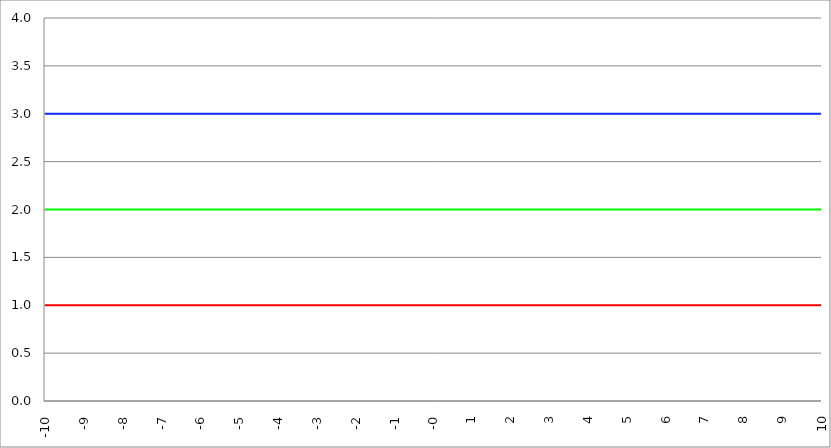
| Category | Series 1 | Series 0 | Series 2 |
|---|---|---|---|
| -10.0 | 1 | 2 | 3 |
| -9.99 | 1 | 2 | 3 |
| -9.98 | 1 | 2 | 3 |
| -9.97 | 1 | 2 | 3 |
| -9.96 | 1 | 2 | 3 |
| -9.95 | 1 | 2 | 3 |
| -9.940000000000001 | 1 | 2 | 3 |
| -9.930000000000001 | 1 | 2 | 3 |
| -9.920000000000002 | 1 | 2 | 3 |
| -9.91 | 1 | 2 | 3 |
| -9.900000000000002 | 1 | 2 | 3 |
| -9.890000000000002 | 1 | 2 | 3 |
| -9.880000000000003 | 1 | 2 | 3 |
| -9.870000000000003 | 1 | 2 | 3 |
| -9.860000000000001 | 1 | 2 | 3 |
| -9.850000000000003 | 1 | 2 | 3 |
| -9.840000000000003 | 1 | 2 | 3 |
| -9.830000000000004 | 1 | 2 | 3 |
| -9.820000000000004 | 1 | 2 | 3 |
| -9.810000000000004 | 1 | 2 | 3 |
| -9.800000000000004 | 1 | 2 | 3 |
| -9.790000000000004 | 1 | 2 | 3 |
| -9.780000000000005 | 1 | 2 | 3 |
| -9.770000000000005 | 1 | 2 | 3 |
| -9.760000000000005 | 1 | 2 | 3 |
| -9.750000000000005 | 1 | 2 | 3 |
| -9.740000000000006 | 1 | 2 | 3 |
| -9.730000000000006 | 1 | 2 | 3 |
| -9.720000000000006 | 1 | 2 | 3 |
| -9.710000000000006 | 1 | 2 | 3 |
| -9.700000000000006 | 1 | 2 | 3 |
| -9.690000000000007 | 1 | 2 | 3 |
| -9.680000000000007 | 1 | 2 | 3 |
| -9.670000000000007 | 1 | 2 | 3 |
| -9.660000000000007 | 1 | 2 | 3 |
| -9.650000000000007 | 1 | 2 | 3 |
| -9.640000000000008 | 1 | 2 | 3 |
| -9.630000000000008 | 1 | 2 | 3 |
| -9.620000000000008 | 1 | 2 | 3 |
| -9.610000000000008 | 1 | 2 | 3 |
| -9.600000000000009 | 1 | 2 | 3 |
| -9.590000000000009 | 1 | 2 | 3 |
| -9.580000000000007 | 1 | 2 | 3 |
| -9.57000000000001 | 1 | 2 | 3 |
| -9.56000000000001 | 1 | 2 | 3 |
| -9.55000000000001 | 1 | 2 | 3 |
| -9.54000000000001 | 1 | 2 | 3 |
| -9.53000000000001 | 1 | 2 | 3 |
| -9.52000000000001 | 1 | 2 | 3 |
| -9.51000000000001 | 1 | 2 | 3 |
| -9.50000000000001 | 1 | 2 | 3 |
| -9.49000000000001 | 1 | 2 | 3 |
| -9.48000000000001 | 1 | 2 | 3 |
| -9.47000000000001 | 1 | 2 | 3 |
| -9.46000000000001 | 1 | 2 | 3 |
| -9.45000000000001 | 1 | 2 | 3 |
| -9.44000000000001 | 1 | 2 | 3 |
| -9.430000000000012 | 1 | 2 | 3 |
| -9.420000000000012 | 1 | 2 | 3 |
| -9.410000000000013 | 1 | 2 | 3 |
| -9.400000000000013 | 1 | 2 | 3 |
| -9.390000000000011 | 1 | 2 | 3 |
| -9.380000000000013 | 1 | 2 | 3 |
| -9.370000000000013 | 1 | 2 | 3 |
| -9.360000000000014 | 1 | 2 | 3 |
| -9.350000000000014 | 1 | 2 | 3 |
| -9.340000000000014 | 1 | 2 | 3 |
| -9.330000000000014 | 1 | 2 | 3 |
| -9.320000000000014 | 1 | 2 | 3 |
| -9.310000000000015 | 1 | 2 | 3 |
| -9.300000000000013 | 1 | 2 | 3 |
| -9.290000000000015 | 1 | 2 | 3 |
| -9.280000000000015 | 1 | 2 | 3 |
| -9.270000000000016 | 1 | 2 | 3 |
| -9.260000000000016 | 1 | 2 | 3 |
| -9.250000000000014 | 1 | 2 | 3 |
| -9.240000000000016 | 1 | 2 | 3 |
| -9.230000000000016 | 1 | 2 | 3 |
| -9.220000000000017 | 1 | 2 | 3 |
| -9.210000000000017 | 1 | 2 | 3 |
| -9.200000000000017 | 1 | 2 | 3 |
| -9.190000000000017 | 1 | 2 | 3 |
| -9.180000000000017 | 1 | 2 | 3 |
| -9.170000000000018 | 1 | 2 | 3 |
| -9.160000000000016 | 1 | 2 | 3 |
| -9.150000000000018 | 1 | 2 | 3 |
| -9.140000000000018 | 1 | 2 | 3 |
| -9.130000000000019 | 1 | 2 | 3 |
| -9.120000000000019 | 1 | 2 | 3 |
| -9.110000000000017 | 1 | 2 | 3 |
| -9.10000000000002 | 1 | 2 | 3 |
| -9.09000000000002 | 1 | 2 | 3 |
| -9.08000000000002 | 1 | 2 | 3 |
| -9.07000000000002 | 1 | 2 | 3 |
| -9.06000000000002 | 1 | 2 | 3 |
| -9.05000000000002 | 1 | 2 | 3 |
| -9.04000000000002 | 1 | 2 | 3 |
| -9.03000000000002 | 1 | 2 | 3 |
| -9.020000000000021 | 1 | 2 | 3 |
| -9.010000000000021 | 1 | 2 | 3 |
| -9.000000000000021 | 1 | 2 | 3 |
| -8.990000000000022 | 1 | 2 | 3 |
| -8.980000000000022 | 1 | 2 | 3 |
| -8.97000000000002 | 1 | 2 | 3 |
| -8.960000000000022 | 1 | 2 | 3 |
| -8.950000000000022 | 1 | 2 | 3 |
| -8.940000000000023 | 1 | 2 | 3 |
| -8.930000000000023 | 1 | 2 | 3 |
| -8.920000000000023 | 1 | 2 | 3 |
| -8.910000000000023 | 1 | 2 | 3 |
| -8.900000000000023 | 1 | 2 | 3 |
| -8.890000000000024 | 1 | 2 | 3 |
| -8.880000000000024 | 1 | 2 | 3 |
| -8.870000000000024 | 1 | 2 | 3 |
| -8.860000000000024 | 1 | 2 | 3 |
| -8.850000000000025 | 1 | 2 | 3 |
| -8.840000000000025 | 1 | 2 | 3 |
| -8.830000000000025 | 1 | 2 | 3 |
| -8.820000000000025 | 1 | 2 | 3 |
| -8.810000000000025 | 1 | 2 | 3 |
| -8.800000000000026 | 1 | 2 | 3 |
| -8.790000000000026 | 1 | 2 | 3 |
| -8.780000000000026 | 1 | 2 | 3 |
| -8.770000000000026 | 1 | 2 | 3 |
| -8.760000000000026 | 1 | 2 | 3 |
| -8.750000000000027 | 1 | 2 | 3 |
| -8.740000000000027 | 1 | 2 | 3 |
| -8.730000000000027 | 1 | 2 | 3 |
| -8.720000000000027 | 1 | 2 | 3 |
| -8.710000000000027 | 1 | 2 | 3 |
| -8.700000000000028 | 1 | 2 | 3 |
| -8.690000000000028 | 1 | 2 | 3 |
| -8.680000000000028 | 1 | 2 | 3 |
| -8.670000000000028 | 1 | 2 | 3 |
| -8.660000000000029 | 1 | 2 | 3 |
| -8.650000000000029 | 1 | 2 | 3 |
| -8.640000000000029 | 1 | 2 | 3 |
| -8.63000000000003 | 1 | 2 | 3 |
| -8.62000000000003 | 1 | 2 | 3 |
| -8.61000000000003 | 1 | 2 | 3 |
| -8.60000000000003 | 1 | 2 | 3 |
| -8.59000000000003 | 1 | 2 | 3 |
| -8.58000000000003 | 1 | 2 | 3 |
| -8.57000000000003 | 1 | 2 | 3 |
| -8.56000000000003 | 1 | 2 | 3 |
| -8.55000000000003 | 1 | 2 | 3 |
| -8.540000000000031 | 1 | 2 | 3 |
| -8.530000000000031 | 1 | 2 | 3 |
| -8.520000000000032 | 1 | 2 | 3 |
| -8.510000000000032 | 1 | 2 | 3 |
| -8.50000000000003 | 1 | 2 | 3 |
| -8.490000000000032 | 1 | 2 | 3 |
| -8.480000000000032 | 1 | 2 | 3 |
| -8.470000000000033 | 1 | 2 | 3 |
| -8.460000000000033 | 1 | 2 | 3 |
| -8.450000000000033 | 1 | 2 | 3 |
| -8.440000000000033 | 1 | 2 | 3 |
| -8.430000000000033 | 1 | 2 | 3 |
| -8.420000000000034 | 1 | 2 | 3 |
| -8.410000000000032 | 1 | 2 | 3 |
| -8.400000000000034 | 1 | 2 | 3 |
| -8.390000000000034 | 1 | 2 | 3 |
| -8.380000000000035 | 1 | 2 | 3 |
| -8.370000000000035 | 1 | 2 | 3 |
| -8.360000000000033 | 1 | 2 | 3 |
| -8.350000000000035 | 1 | 2 | 3 |
| -8.340000000000035 | 1 | 2 | 3 |
| -8.330000000000036 | 1 | 2 | 3 |
| -8.320000000000036 | 1 | 2 | 3 |
| -8.310000000000034 | 1 | 2 | 3 |
| -8.300000000000036 | 1 | 2 | 3 |
| -8.290000000000036 | 1 | 2 | 3 |
| -8.280000000000037 | 1 | 2 | 3 |
| -8.270000000000037 | 1 | 2 | 3 |
| -8.260000000000037 | 1 | 2 | 3 |
| -8.250000000000037 | 1 | 2 | 3 |
| -8.240000000000038 | 1 | 2 | 3 |
| -8.230000000000038 | 1 | 2 | 3 |
| -8.220000000000038 | 1 | 2 | 3 |
| -8.210000000000038 | 1 | 2 | 3 |
| -8.200000000000038 | 1 | 2 | 3 |
| -8.190000000000039 | 1 | 2 | 3 |
| -8.180000000000039 | 1 | 2 | 3 |
| -8.170000000000037 | 1 | 2 | 3 |
| -8.16000000000004 | 1 | 2 | 3 |
| -8.15000000000004 | 1 | 2 | 3 |
| -8.14000000000004 | 1 | 2 | 3 |
| -8.13000000000004 | 1 | 2 | 3 |
| -8.12000000000004 | 1 | 2 | 3 |
| -8.11000000000004 | 1 | 2 | 3 |
| -8.10000000000004 | 1 | 2 | 3 |
| -8.09000000000004 | 1 | 2 | 3 |
| -8.08000000000004 | 1 | 2 | 3 |
| -8.07000000000004 | 1 | 2 | 3 |
| -8.06000000000004 | 1 | 2 | 3 |
| -8.05000000000004 | 1 | 2 | 3 |
| -8.040000000000042 | 1 | 2 | 3 |
| -8.03000000000004 | 1 | 2 | 3 |
| -8.020000000000042 | 1 | 2 | 3 |
| -8.010000000000042 | 1 | 2 | 3 |
| -8.000000000000043 | 1 | 2 | 3 |
| -7.990000000000043 | 1 | 2 | 3 |
| -7.980000000000043 | 1 | 2 | 3 |
| -7.970000000000043 | 1 | 2 | 3 |
| -7.960000000000043 | 1 | 2 | 3 |
| -7.950000000000044 | 1 | 2 | 3 |
| -7.940000000000044 | 1 | 2 | 3 |
| -7.930000000000044 | 1 | 2 | 3 |
| -7.920000000000044 | 1 | 2 | 3 |
| -7.910000000000044 | 1 | 2 | 3 |
| -7.900000000000044 | 1 | 2 | 3 |
| -7.890000000000045 | 1 | 2 | 3 |
| -7.880000000000045 | 1 | 2 | 3 |
| -7.870000000000045 | 1 | 2 | 3 |
| -7.860000000000046 | 1 | 2 | 3 |
| -7.850000000000046 | 1 | 2 | 3 |
| -7.840000000000046 | 1 | 2 | 3 |
| -7.830000000000046 | 1 | 2 | 3 |
| -7.820000000000046 | 1 | 2 | 3 |
| -7.810000000000047 | 1 | 2 | 3 |
| -7.800000000000047 | 1 | 2 | 3 |
| -7.790000000000047 | 1 | 2 | 3 |
| -7.780000000000047 | 1 | 2 | 3 |
| -7.770000000000047 | 1 | 2 | 3 |
| -7.760000000000048 | 1 | 2 | 3 |
| -7.750000000000048 | 1 | 2 | 3 |
| -7.740000000000048 | 1 | 2 | 3 |
| -7.730000000000048 | 1 | 2 | 3 |
| -7.720000000000049 | 1 | 2 | 3 |
| -7.710000000000049 | 1 | 2 | 3 |
| -7.700000000000049 | 1 | 2 | 3 |
| -7.690000000000049 | 1 | 2 | 3 |
| -7.680000000000049 | 1 | 2 | 3 |
| -7.67000000000005 | 1 | 2 | 3 |
| -7.66000000000005 | 1 | 2 | 3 |
| -7.65000000000005 | 1 | 2 | 3 |
| -7.64000000000005 | 1 | 2 | 3 |
| -7.63000000000005 | 1 | 2 | 3 |
| -7.620000000000051 | 1 | 2 | 3 |
| -7.610000000000051 | 1 | 2 | 3 |
| -7.600000000000051 | 1 | 2 | 3 |
| -7.590000000000051 | 1 | 2 | 3 |
| -7.580000000000052 | 1 | 2 | 3 |
| -7.570000000000052 | 1 | 2 | 3 |
| -7.560000000000052 | 1 | 2 | 3 |
| -7.550000000000052 | 1 | 2 | 3 |
| -7.540000000000052 | 1 | 2 | 3 |
| -7.530000000000053 | 1 | 2 | 3 |
| -7.520000000000053 | 1 | 2 | 3 |
| -7.510000000000053 | 1 | 2 | 3 |
| -7.500000000000053 | 1 | 2 | 3 |
| -7.490000000000053 | 1 | 2 | 3 |
| -7.480000000000054 | 1 | 2 | 3 |
| -7.470000000000054 | 1 | 2 | 3 |
| -7.460000000000054 | 1 | 2 | 3 |
| -7.450000000000054 | 1 | 2 | 3 |
| -7.440000000000054 | 1 | 2 | 3 |
| -7.430000000000054 | 1 | 2 | 3 |
| -7.420000000000055 | 1 | 2 | 3 |
| -7.410000000000055 | 1 | 2 | 3 |
| -7.400000000000055 | 1 | 2 | 3 |
| -7.390000000000056 | 1 | 2 | 3 |
| -7.380000000000056 | 1 | 2 | 3 |
| -7.370000000000056 | 1 | 2 | 3 |
| -7.360000000000056 | 1 | 2 | 3 |
| -7.350000000000056 | 1 | 2 | 3 |
| -7.340000000000057 | 1 | 2 | 3 |
| -7.330000000000057 | 1 | 2 | 3 |
| -7.320000000000057 | 1 | 2 | 3 |
| -7.310000000000057 | 1 | 2 | 3 |
| -7.300000000000058 | 1 | 2 | 3 |
| -7.290000000000058 | 1 | 2 | 3 |
| -7.280000000000058 | 1 | 2 | 3 |
| -7.270000000000058 | 1 | 2 | 3 |
| -7.260000000000058 | 1 | 2 | 3 |
| -7.250000000000059 | 1 | 2 | 3 |
| -7.240000000000059 | 1 | 2 | 3 |
| -7.23000000000006 | 1 | 2 | 3 |
| -7.220000000000059 | 1 | 2 | 3 |
| -7.210000000000059 | 1 | 2 | 3 |
| -7.20000000000006 | 1 | 2 | 3 |
| -7.19000000000006 | 1 | 2 | 3 |
| -7.18000000000006 | 1 | 2 | 3 |
| -7.17000000000006 | 1 | 2 | 3 |
| -7.160000000000061 | 1 | 2 | 3 |
| -7.150000000000061 | 1 | 2 | 3 |
| -7.140000000000061 | 1 | 2 | 3 |
| -7.130000000000061 | 1 | 2 | 3 |
| -7.120000000000061 | 1 | 2 | 3 |
| -7.110000000000062 | 1 | 2 | 3 |
| -7.100000000000062 | 1 | 2 | 3 |
| -7.090000000000062 | 1 | 2 | 3 |
| -7.080000000000062 | 1 | 2 | 3 |
| -7.070000000000062 | 1 | 2 | 3 |
| -7.060000000000063 | 1 | 2 | 3 |
| -7.050000000000063 | 1 | 2 | 3 |
| -7.040000000000063 | 1 | 2 | 3 |
| -7.030000000000063 | 1 | 2 | 3 |
| -7.020000000000064 | 1 | 2 | 3 |
| -7.010000000000064 | 1 | 2 | 3 |
| -7.000000000000064 | 1 | 2 | 3 |
| -6.990000000000064 | 1 | 2 | 3 |
| -6.980000000000064 | 1 | 2 | 3 |
| -6.970000000000064 | 1 | 2 | 3 |
| -6.960000000000064 | 1 | 2 | 3 |
| -6.950000000000064 | 1 | 2 | 3 |
| -6.940000000000065 | 1 | 2 | 3 |
| -6.930000000000065 | 1 | 2 | 3 |
| -6.920000000000065 | 1 | 2 | 3 |
| -6.910000000000065 | 1 | 2 | 3 |
| -6.900000000000066 | 1 | 2 | 3 |
| -6.890000000000066 | 1 | 2 | 3 |
| -6.880000000000066 | 1 | 2 | 3 |
| -6.870000000000066 | 1 | 2 | 3 |
| -6.860000000000067 | 1 | 2 | 3 |
| -6.850000000000067 | 1 | 2 | 3 |
| -6.840000000000067 | 1 | 2 | 3 |
| -6.830000000000067 | 1 | 2 | 3 |
| -6.820000000000068 | 1 | 2 | 3 |
| -6.810000000000068 | 1 | 2 | 3 |
| -6.800000000000068 | 1 | 2 | 3 |
| -6.790000000000068 | 1 | 2 | 3 |
| -6.780000000000068 | 1 | 2 | 3 |
| -6.770000000000068 | 1 | 2 | 3 |
| -6.760000000000069 | 1 | 2 | 3 |
| -6.75000000000007 | 1 | 2 | 3 |
| -6.74000000000007 | 1 | 2 | 3 |
| -6.73000000000007 | 1 | 2 | 3 |
| -6.72000000000007 | 1 | 2 | 3 |
| -6.71000000000007 | 1 | 2 | 3 |
| -6.70000000000007 | 1 | 2 | 3 |
| -6.69000000000007 | 1 | 2 | 3 |
| -6.680000000000071 | 1 | 2 | 3 |
| -6.670000000000071 | 1 | 2 | 3 |
| -6.660000000000071 | 1 | 2 | 3 |
| -6.650000000000071 | 1 | 2 | 3 |
| -6.640000000000072 | 1 | 2 | 3 |
| -6.630000000000072 | 1 | 2 | 3 |
| -6.620000000000072 | 1 | 2 | 3 |
| -6.610000000000072 | 1 | 2 | 3 |
| -6.600000000000072 | 1 | 2 | 3 |
| -6.590000000000073 | 1 | 2 | 3 |
| -6.580000000000073 | 1 | 2 | 3 |
| -6.570000000000073 | 1 | 2 | 3 |
| -6.560000000000073 | 1 | 2 | 3 |
| -6.550000000000074 | 1 | 2 | 3 |
| -6.540000000000074 | 1 | 2 | 3 |
| -6.530000000000074 | 1 | 2 | 3 |
| -6.520000000000074 | 1 | 2 | 3 |
| -6.510000000000074 | 1 | 2 | 3 |
| -6.500000000000074 | 1 | 2 | 3 |
| -6.490000000000074 | 1 | 2 | 3 |
| -6.480000000000074 | 1 | 2 | 3 |
| -6.470000000000075 | 1 | 2 | 3 |
| -6.460000000000075 | 1 | 2 | 3 |
| -6.450000000000075 | 1 | 2 | 3 |
| -6.440000000000075 | 1 | 2 | 3 |
| -6.430000000000076 | 1 | 2 | 3 |
| -6.420000000000076 | 1 | 2 | 3 |
| -6.410000000000076 | 1 | 2 | 3 |
| -6.400000000000076 | 1 | 2 | 3 |
| -6.390000000000077 | 1 | 2 | 3 |
| -6.380000000000077 | 1 | 2 | 3 |
| -6.370000000000077 | 1 | 2 | 3 |
| -6.360000000000078 | 1 | 2 | 3 |
| -6.350000000000078 | 1 | 2 | 3 |
| -6.340000000000078 | 1 | 2 | 3 |
| -6.330000000000078 | 1 | 2 | 3 |
| -6.320000000000078 | 1 | 2 | 3 |
| -6.310000000000079 | 1 | 2 | 3 |
| -6.300000000000079 | 1 | 2 | 3 |
| -6.29000000000008 | 1 | 2 | 3 |
| -6.28000000000008 | 1 | 2 | 3 |
| -6.27000000000008 | 1 | 2 | 3 |
| -6.26000000000008 | 1 | 2 | 3 |
| -6.25000000000008 | 1 | 2 | 3 |
| -6.24000000000008 | 1 | 2 | 3 |
| -6.23000000000008 | 1 | 2 | 3 |
| -6.220000000000081 | 1 | 2 | 3 |
| -6.210000000000081 | 1 | 2 | 3 |
| -6.200000000000081 | 1 | 2 | 3 |
| -6.190000000000081 | 1 | 2 | 3 |
| -6.180000000000081 | 1 | 2 | 3 |
| -6.170000000000082 | 1 | 2 | 3 |
| -6.160000000000082 | 1 | 2 | 3 |
| -6.150000000000082 | 1 | 2 | 3 |
| -6.140000000000082 | 1 | 2 | 3 |
| -6.130000000000082 | 1 | 2 | 3 |
| -6.120000000000083 | 1 | 2 | 3 |
| -6.110000000000083 | 1 | 2 | 3 |
| -6.100000000000083 | 1 | 2 | 3 |
| -6.090000000000083 | 1 | 2 | 3 |
| -6.080000000000084 | 1 | 2 | 3 |
| -6.070000000000084 | 1 | 2 | 3 |
| -6.060000000000084 | 1 | 2 | 3 |
| -6.050000000000084 | 1 | 2 | 3 |
| -6.040000000000084 | 1 | 2 | 3 |
| -6.030000000000084 | 1 | 2 | 3 |
| -6.020000000000085 | 1 | 2 | 3 |
| -6.010000000000085 | 1 | 2 | 3 |
| -6.000000000000085 | 1 | 2 | 3 |
| -5.990000000000085 | 1 | 2 | 3 |
| -5.980000000000085 | 1 | 2 | 3 |
| -5.970000000000085 | 1 | 2 | 3 |
| -5.960000000000086 | 1 | 2 | 3 |
| -5.950000000000086 | 1 | 2 | 3 |
| -5.940000000000086 | 1 | 2 | 3 |
| -5.930000000000086 | 1 | 2 | 3 |
| -5.920000000000087 | 1 | 2 | 3 |
| -5.910000000000087 | 1 | 2 | 3 |
| -5.900000000000087 | 1 | 2 | 3 |
| -5.890000000000088 | 1 | 2 | 3 |
| -5.880000000000088 | 1 | 2 | 3 |
| -5.870000000000088 | 1 | 2 | 3 |
| -5.860000000000088 | 1 | 2 | 3 |
| -5.850000000000088 | 1 | 2 | 3 |
| -5.840000000000089 | 1 | 2 | 3 |
| -5.830000000000089 | 1 | 2 | 3 |
| -5.820000000000089 | 1 | 2 | 3 |
| -5.810000000000089 | 1 | 2 | 3 |
| -5.800000000000089 | 1 | 2 | 3 |
| -5.79000000000009 | 1 | 2 | 3 |
| -5.78000000000009 | 1 | 2 | 3 |
| -5.77000000000009 | 1 | 2 | 3 |
| -5.76000000000009 | 1 | 2 | 3 |
| -5.750000000000091 | 1 | 2 | 3 |
| -5.740000000000091 | 1 | 2 | 3 |
| -5.730000000000091 | 1 | 2 | 3 |
| -5.720000000000091 | 1 | 2 | 3 |
| -5.710000000000091 | 1 | 2 | 3 |
| -5.700000000000092 | 1 | 2 | 3 |
| -5.690000000000092 | 1 | 2 | 3 |
| -5.680000000000092 | 1 | 2 | 3 |
| -5.670000000000092 | 1 | 2 | 3 |
| -5.660000000000092 | 1 | 2 | 3 |
| -5.650000000000093 | 1 | 2 | 3 |
| -5.640000000000093 | 1 | 2 | 3 |
| -5.630000000000093 | 1 | 2 | 3 |
| -5.620000000000093 | 1 | 2 | 3 |
| -5.610000000000093 | 1 | 2 | 3 |
| -5.600000000000094 | 1 | 2 | 3 |
| -5.590000000000094 | 1 | 2 | 3 |
| -5.580000000000094 | 1 | 2 | 3 |
| -5.570000000000094 | 1 | 2 | 3 |
| -5.560000000000095 | 1 | 2 | 3 |
| -5.550000000000095 | 1 | 2 | 3 |
| -5.540000000000095 | 1 | 2 | 3 |
| -5.530000000000095 | 1 | 2 | 3 |
| -5.520000000000095 | 1 | 2 | 3 |
| -5.510000000000096 | 1 | 2 | 3 |
| -5.500000000000096 | 1 | 2 | 3 |
| -5.490000000000096 | 1 | 2 | 3 |
| -5.480000000000096 | 1 | 2 | 3 |
| -5.470000000000096 | 1 | 2 | 3 |
| -5.460000000000097 | 1 | 2 | 3 |
| -5.450000000000097 | 1 | 2 | 3 |
| -5.440000000000097 | 1 | 2 | 3 |
| -5.430000000000097 | 1 | 2 | 3 |
| -5.420000000000098 | 1 | 2 | 3 |
| -5.410000000000098 | 1 | 2 | 3 |
| -5.400000000000098 | 1 | 2 | 3 |
| -5.390000000000098 | 1 | 2 | 3 |
| -5.380000000000098 | 1 | 2 | 3 |
| -5.370000000000099 | 1 | 2 | 3 |
| -5.360000000000099 | 1 | 2 | 3 |
| -5.350000000000099 | 1 | 2 | 3 |
| -5.340000000000099 | 1 | 2 | 3 |
| -5.330000000000099 | 1 | 2 | 3 |
| -5.3200000000001 | 1 | 2 | 3 |
| -5.3100000000001 | 1 | 2 | 3 |
| -5.3000000000001 | 1 | 2 | 3 |
| -5.2900000000001 | 1 | 2 | 3 |
| -5.2800000000001 | 1 | 2 | 3 |
| -5.2700000000001 | 1 | 2 | 3 |
| -5.260000000000101 | 1 | 2 | 3 |
| -5.250000000000101 | 1 | 2 | 3 |
| -5.240000000000101 | 1 | 2 | 3 |
| -5.230000000000101 | 1 | 2 | 3 |
| -5.220000000000102 | 1 | 2 | 3 |
| -5.210000000000102 | 1 | 2 | 3 |
| -5.200000000000102 | 1 | 2 | 3 |
| -5.190000000000103 | 1 | 2 | 3 |
| -5.180000000000103 | 1 | 2 | 3 |
| -5.170000000000103 | 1 | 2 | 3 |
| -5.160000000000103 | 1 | 2 | 3 |
| -5.150000000000103 | 1 | 2 | 3 |
| -5.140000000000104 | 1 | 2 | 3 |
| -5.130000000000104 | 1 | 2 | 3 |
| -5.120000000000104 | 1 | 2 | 3 |
| -5.110000000000104 | 1 | 2 | 3 |
| -5.100000000000104 | 1 | 2 | 3 |
| -5.090000000000104 | 1 | 2 | 3 |
| -5.080000000000104 | 1 | 2 | 3 |
| -5.070000000000105 | 1 | 2 | 3 |
| -5.060000000000105 | 1 | 2 | 3 |
| -5.050000000000105 | 1 | 2 | 3 |
| -5.040000000000105 | 1 | 2 | 3 |
| -5.030000000000105 | 1 | 2 | 3 |
| -5.020000000000106 | 1 | 2 | 3 |
| -5.010000000000106 | 1 | 2 | 3 |
| -5.000000000000106 | 1 | 2 | 3 |
| -4.990000000000106 | 1 | 2 | 3 |
| -4.980000000000106 | 1 | 2 | 3 |
| -4.970000000000107 | 1 | 2 | 3 |
| -4.960000000000107 | 1 | 2 | 3 |
| -4.950000000000107 | 1 | 2 | 3 |
| -4.940000000000107 | 1 | 2 | 3 |
| -4.930000000000108 | 1 | 2 | 3 |
| -4.920000000000108 | 1 | 2 | 3 |
| -4.910000000000108 | 1 | 2 | 3 |
| -4.900000000000108 | 1 | 2 | 3 |
| -4.890000000000109 | 1 | 2 | 3 |
| -4.88000000000011 | 1 | 2 | 3 |
| -4.87000000000011 | 1 | 2 | 3 |
| -4.86000000000011 | 1 | 2 | 3 |
| -4.85000000000011 | 1 | 2 | 3 |
| -4.84000000000011 | 1 | 2 | 3 |
| -4.83000000000011 | 1 | 2 | 3 |
| -4.82000000000011 | 1 | 2 | 3 |
| -4.810000000000111 | 1 | 2 | 3 |
| -4.800000000000111 | 1 | 2 | 3 |
| -4.790000000000111 | 1 | 2 | 3 |
| -4.780000000000111 | 1 | 2 | 3 |
| -4.770000000000111 | 1 | 2 | 3 |
| -4.760000000000112 | 1 | 2 | 3 |
| -4.750000000000112 | 1 | 2 | 3 |
| -4.740000000000112 | 1 | 2 | 3 |
| -4.730000000000112 | 1 | 2 | 3 |
| -4.720000000000112 | 1 | 2 | 3 |
| -4.710000000000113 | 1 | 2 | 3 |
| -4.700000000000113 | 1 | 2 | 3 |
| -4.690000000000113 | 1 | 2 | 3 |
| -4.680000000000113 | 1 | 2 | 3 |
| -4.670000000000114 | 1 | 2 | 3 |
| -4.660000000000114 | 1 | 2 | 3 |
| -4.650000000000114 | 1 | 2 | 3 |
| -4.640000000000114 | 1 | 2 | 3 |
| -4.630000000000114 | 1 | 2 | 3 |
| -4.620000000000115 | 1 | 2 | 3 |
| -4.610000000000115 | 1 | 2 | 3 |
| -4.600000000000115 | 1 | 2 | 3 |
| -4.590000000000115 | 1 | 2 | 3 |
| -4.580000000000115 | 1 | 2 | 3 |
| -4.570000000000115 | 1 | 2 | 3 |
| -4.560000000000116 | 1 | 2 | 3 |
| -4.550000000000116 | 1 | 2 | 3 |
| -4.540000000000116 | 1 | 2 | 3 |
| -4.530000000000116 | 1 | 2 | 3 |
| -4.520000000000117 | 1 | 2 | 3 |
| -4.510000000000117 | 1 | 2 | 3 |
| -4.500000000000117 | 1 | 2 | 3 |
| -4.490000000000117 | 1 | 2 | 3 |
| -4.480000000000117 | 1 | 2 | 3 |
| -4.470000000000117 | 1 | 2 | 3 |
| -4.460000000000118 | 1 | 2 | 3 |
| -4.450000000000118 | 1 | 2 | 3 |
| -4.440000000000118 | 1 | 2 | 3 |
| -4.430000000000118 | 1 | 2 | 3 |
| -4.420000000000119 | 1 | 2 | 3 |
| -4.41000000000012 | 1 | 2 | 3 |
| -4.40000000000012 | 1 | 2 | 3 |
| -4.39000000000012 | 1 | 2 | 3 |
| -4.38000000000012 | 1 | 2 | 3 |
| -4.37000000000012 | 1 | 2 | 3 |
| -4.36000000000012 | 1 | 2 | 3 |
| -4.35000000000012 | 1 | 2 | 3 |
| -4.34000000000012 | 1 | 2 | 3 |
| -4.33000000000012 | 1 | 2 | 3 |
| -4.320000000000121 | 1 | 2 | 3 |
| -4.310000000000121 | 1 | 2 | 3 |
| -4.300000000000121 | 1 | 2 | 3 |
| -4.290000000000121 | 1 | 2 | 3 |
| -4.280000000000121 | 1 | 2 | 3 |
| -4.270000000000122 | 1 | 2 | 3 |
| -4.260000000000122 | 1 | 2 | 3 |
| -4.250000000000122 | 1 | 2 | 3 |
| -4.240000000000122 | 1 | 2 | 3 |
| -4.230000000000122 | 1 | 2 | 3 |
| -4.220000000000123 | 1 | 2 | 3 |
| -4.210000000000123 | 1 | 2 | 3 |
| -4.200000000000123 | 1 | 2 | 3 |
| -4.190000000000124 | 1 | 2 | 3 |
| -4.180000000000124 | 1 | 2 | 3 |
| -4.170000000000124 | 1 | 2 | 3 |
| -4.160000000000124 | 1 | 2 | 3 |
| -4.150000000000124 | 1 | 2 | 3 |
| -4.140000000000124 | 1 | 2 | 3 |
| -4.130000000000125 | 1 | 2 | 3 |
| -4.120000000000125 | 1 | 2 | 3 |
| -4.110000000000125 | 1 | 2 | 3 |
| -4.100000000000125 | 1 | 2 | 3 |
| -4.090000000000125 | 1 | 2 | 3 |
| -4.080000000000126 | 1 | 2 | 3 |
| -4.070000000000126 | 1 | 2 | 3 |
| -4.060000000000126 | 1 | 2 | 3 |
| -4.050000000000126 | 1 | 2 | 3 |
| -4.040000000000127 | 1 | 2 | 3 |
| -4.030000000000127 | 1 | 2 | 3 |
| -4.020000000000127 | 1 | 2 | 3 |
| -4.010000000000127 | 1 | 2 | 3 |
| -4.000000000000127 | 1 | 2 | 3 |
| -3.990000000000128 | 1 | 2 | 3 |
| -3.980000000000128 | 1 | 2 | 3 |
| -3.970000000000129 | 1 | 2 | 3 |
| -3.960000000000129 | 1 | 2 | 3 |
| -3.950000000000129 | 1 | 2 | 3 |
| -3.940000000000129 | 1 | 2 | 3 |
| -3.930000000000129 | 1 | 2 | 3 |
| -3.92000000000013 | 1 | 2 | 3 |
| -3.91000000000013 | 1 | 2 | 3 |
| -3.90000000000013 | 1 | 2 | 3 |
| -3.89000000000013 | 1 | 2 | 3 |
| -3.88000000000013 | 1 | 2 | 3 |
| -3.870000000000131 | 1 | 2 | 3 |
| -3.860000000000131 | 1 | 2 | 3 |
| -3.850000000000131 | 1 | 2 | 3 |
| -3.840000000000131 | 1 | 2 | 3 |
| -3.830000000000131 | 1 | 2 | 3 |
| -3.820000000000132 | 1 | 2 | 3 |
| -3.810000000000132 | 1 | 2 | 3 |
| -3.800000000000132 | 1 | 2 | 3 |
| -3.790000000000132 | 1 | 2 | 3 |
| -3.780000000000132 | 1 | 2 | 3 |
| -3.770000000000133 | 1 | 2 | 3 |
| -3.760000000000133 | 1 | 2 | 3 |
| -3.750000000000133 | 1 | 2 | 3 |
| -3.740000000000133 | 1 | 2 | 3 |
| -3.730000000000134 | 1 | 2 | 3 |
| -3.720000000000134 | 1 | 2 | 3 |
| -3.710000000000134 | 1 | 2 | 3 |
| -3.700000000000134 | 1 | 2 | 3 |
| -3.690000000000134 | 1 | 2 | 3 |
| -3.680000000000135 | 1 | 2 | 3 |
| -3.670000000000135 | 1 | 2 | 3 |
| -3.660000000000135 | 1 | 2 | 3 |
| -3.650000000000135 | 1 | 2 | 3 |
| -3.640000000000135 | 1 | 2 | 3 |
| -3.630000000000136 | 1 | 2 | 3 |
| -3.620000000000136 | 1 | 2 | 3 |
| -3.610000000000136 | 1 | 2 | 3 |
| -3.600000000000136 | 1 | 2 | 3 |
| -3.590000000000137 | 1 | 2 | 3 |
| -3.580000000000137 | 1 | 2 | 3 |
| -3.570000000000137 | 1 | 2 | 3 |
| -3.560000000000137 | 1 | 2 | 3 |
| -3.550000000000137 | 1 | 2 | 3 |
| -3.540000000000138 | 1 | 2 | 3 |
| -3.530000000000138 | 1 | 2 | 3 |
| -3.520000000000138 | 1 | 2 | 3 |
| -3.510000000000138 | 1 | 2 | 3 |
| -3.500000000000139 | 1 | 2 | 3 |
| -3.490000000000139 | 1 | 2 | 3 |
| -3.480000000000139 | 1 | 2 | 3 |
| -3.470000000000139 | 1 | 2 | 3 |
| -3.460000000000139 | 1 | 2 | 3 |
| -3.45000000000014 | 1 | 2 | 3 |
| -3.44000000000014 | 1 | 2 | 3 |
| -3.43000000000014 | 1 | 2 | 3 |
| -3.42000000000014 | 1 | 2 | 3 |
| -3.41000000000014 | 1 | 2 | 3 |
| -3.400000000000141 | 1 | 2 | 3 |
| -3.390000000000141 | 1 | 2 | 3 |
| -3.380000000000141 | 1 | 2 | 3 |
| -3.370000000000141 | 1 | 2 | 3 |
| -3.360000000000141 | 1 | 2 | 3 |
| -3.350000000000142 | 1 | 2 | 3 |
| -3.340000000000142 | 1 | 2 | 3 |
| -3.330000000000142 | 1 | 2 | 3 |
| -3.320000000000142 | 1 | 2 | 3 |
| -3.310000000000143 | 1 | 2 | 3 |
| -3.300000000000143 | 1 | 2 | 3 |
| -3.290000000000143 | 1 | 2 | 3 |
| -3.280000000000143 | 1 | 2 | 3 |
| -3.270000000000143 | 1 | 2 | 3 |
| -3.260000000000144 | 1 | 2 | 3 |
| -3.250000000000144 | 1 | 2 | 3 |
| -3.240000000000144 | 1 | 2 | 3 |
| -3.230000000000144 | 1 | 2 | 3 |
| -3.220000000000145 | 1 | 2 | 3 |
| -3.210000000000145 | 1 | 2 | 3 |
| -3.200000000000145 | 1 | 2 | 3 |
| -3.190000000000145 | 1 | 2 | 3 |
| -3.180000000000145 | 1 | 2 | 3 |
| -3.170000000000146 | 1 | 2 | 3 |
| -3.160000000000146 | 1 | 2 | 3 |
| -3.150000000000146 | 1 | 2 | 3 |
| -3.140000000000146 | 1 | 2 | 3 |
| -3.130000000000146 | 1 | 2 | 3 |
| -3.120000000000147 | 1 | 2 | 3 |
| -3.110000000000147 | 1 | 2 | 3 |
| -3.100000000000147 | 1 | 2 | 3 |
| -3.090000000000147 | 1 | 2 | 3 |
| -3.080000000000147 | 1 | 2 | 3 |
| -3.070000000000148 | 1 | 2 | 3 |
| -3.060000000000148 | 1 | 2 | 3 |
| -3.050000000000148 | 1 | 2 | 3 |
| -3.040000000000148 | 1 | 2 | 3 |
| -3.030000000000149 | 1 | 2 | 3 |
| -3.020000000000149 | 1 | 2 | 3 |
| -3.010000000000149 | 1 | 2 | 3 |
| -3.000000000000149 | 1 | 2 | 3 |
| -2.990000000000149 | 1 | 2 | 3 |
| -2.98000000000015 | 1 | 2 | 3 |
| -2.97000000000015 | 1 | 2 | 3 |
| -2.96000000000015 | 1 | 2 | 3 |
| -2.95000000000015 | 1 | 2 | 3 |
| -2.94000000000015 | 1 | 2 | 3 |
| -2.930000000000151 | 1 | 2 | 3 |
| -2.920000000000151 | 1 | 2 | 3 |
| -2.910000000000151 | 1 | 2 | 3 |
| -2.900000000000151 | 1 | 2 | 3 |
| -2.890000000000151 | 1 | 2 | 3 |
| -2.880000000000152 | 1 | 2 | 3 |
| -2.870000000000152 | 1 | 2 | 3 |
| -2.860000000000152 | 1 | 2 | 3 |
| -2.850000000000152 | 1 | 2 | 3 |
| -2.840000000000153 | 1 | 2 | 3 |
| -2.830000000000153 | 1 | 2 | 3 |
| -2.820000000000153 | 1 | 2 | 3 |
| -2.810000000000153 | 1 | 2 | 3 |
| -2.800000000000153 | 1 | 2 | 3 |
| -2.790000000000154 | 1 | 2 | 3 |
| -2.780000000000154 | 1 | 2 | 3 |
| -2.770000000000154 | 1 | 2 | 3 |
| -2.760000000000154 | 1 | 2 | 3 |
| -2.750000000000154 | 1 | 2 | 3 |
| -2.740000000000155 | 1 | 2 | 3 |
| -2.730000000000155 | 1 | 2 | 3 |
| -2.720000000000155 | 1 | 2 | 3 |
| -2.710000000000155 | 1 | 2 | 3 |
| -2.700000000000156 | 1 | 2 | 3 |
| -2.690000000000156 | 1 | 2 | 3 |
| -2.680000000000156 | 1 | 2 | 3 |
| -2.670000000000156 | 1 | 2 | 3 |
| -2.660000000000156 | 1 | 2 | 3 |
| -2.650000000000157 | 1 | 2 | 3 |
| -2.640000000000157 | 1 | 2 | 3 |
| -2.630000000000157 | 1 | 2 | 3 |
| -2.620000000000157 | 1 | 2 | 3 |
| -2.610000000000157 | 1 | 2 | 3 |
| -2.600000000000158 | 1 | 2 | 3 |
| -2.590000000000158 | 1 | 2 | 3 |
| -2.580000000000158 | 1 | 2 | 3 |
| -2.570000000000158 | 1 | 2 | 3 |
| -2.560000000000159 | 1 | 2 | 3 |
| -2.550000000000159 | 1 | 2 | 3 |
| -2.54000000000016 | 1 | 2 | 3 |
| -2.530000000000159 | 1 | 2 | 3 |
| -2.520000000000159 | 1 | 2 | 3 |
| -2.51000000000016 | 1 | 2 | 3 |
| -2.50000000000016 | 1 | 2 | 3 |
| -2.49000000000016 | 1 | 2 | 3 |
| -2.48000000000016 | 1 | 2 | 3 |
| -2.47000000000016 | 1 | 2 | 3 |
| -2.460000000000161 | 1 | 2 | 3 |
| -2.450000000000161 | 1 | 2 | 3 |
| -2.440000000000161 | 1 | 2 | 3 |
| -2.430000000000161 | 1 | 2 | 3 |
| -2.420000000000162 | 1 | 2 | 3 |
| -2.410000000000162 | 1 | 2 | 3 |
| -2.400000000000162 | 1 | 2 | 3 |
| -2.390000000000162 | 1 | 2 | 3 |
| -2.380000000000162 | 1 | 2 | 3 |
| -2.370000000000163 | 1 | 2 | 3 |
| -2.360000000000163 | 1 | 2 | 3 |
| -2.350000000000163 | 1 | 2 | 3 |
| -2.340000000000163 | 1 | 2 | 3 |
| -2.330000000000163 | 1 | 2 | 3 |
| -2.320000000000164 | 1 | 2 | 3 |
| -2.310000000000164 | 1 | 2 | 3 |
| -2.300000000000164 | 1 | 2 | 3 |
| -2.290000000000164 | 1 | 2 | 3 |
| -2.280000000000165 | 1 | 2 | 3 |
| -2.270000000000165 | 1 | 2 | 3 |
| -2.260000000000165 | 1 | 2 | 3 |
| -2.250000000000165 | 1 | 2 | 3 |
| -2.240000000000165 | 1 | 2 | 3 |
| -2.230000000000166 | 1 | 2 | 3 |
| -2.220000000000166 | 1 | 2 | 3 |
| -2.210000000000166 | 1 | 2 | 3 |
| -2.200000000000166 | 1 | 2 | 3 |
| -2.190000000000166 | 1 | 2 | 3 |
| -2.180000000000167 | 1 | 2 | 3 |
| -2.170000000000167 | 1 | 2 | 3 |
| -2.160000000000167 | 1 | 2 | 3 |
| -2.150000000000167 | 1 | 2 | 3 |
| -2.140000000000168 | 1 | 2 | 3 |
| -2.130000000000168 | 1 | 2 | 3 |
| -2.120000000000168 | 1 | 2 | 3 |
| -2.110000000000168 | 1 | 2 | 3 |
| -2.100000000000168 | 1 | 2 | 3 |
| -2.090000000000169 | 1 | 2 | 3 |
| -2.080000000000169 | 1 | 2 | 3 |
| -2.070000000000169 | 1 | 2 | 3 |
| -2.060000000000169 | 1 | 2 | 3 |
| -2.050000000000169 | 1 | 2 | 3 |
| -2.04000000000017 | 1 | 2 | 3 |
| -2.03000000000017 | 1 | 2 | 3 |
| -2.02000000000017 | 1 | 2 | 3 |
| -2.01000000000017 | 1 | 2 | 3 |
| -2.000000000000171 | 1 | 2 | 3 |
| -1.99000000000017 | 1 | 2 | 3 |
| -1.98000000000017 | 1 | 2 | 3 |
| -1.97000000000017 | 1 | 2 | 3 |
| -1.96000000000017 | 1 | 2 | 3 |
| -1.95000000000017 | 1 | 2 | 3 |
| -1.94000000000017 | 1 | 2 | 3 |
| -1.93000000000017 | 1 | 2 | 3 |
| -1.92000000000017 | 1 | 2 | 3 |
| -1.91000000000017 | 1 | 2 | 3 |
| -1.90000000000017 | 1 | 2 | 3 |
| -1.89000000000017 | 1 | 2 | 3 |
| -1.88000000000017 | 1 | 2 | 3 |
| -1.87000000000017 | 1 | 2 | 3 |
| -1.86000000000017 | 1 | 2 | 3 |
| -1.85000000000017 | 1 | 2 | 3 |
| -1.84000000000017 | 1 | 2 | 3 |
| -1.83000000000017 | 1 | 2 | 3 |
| -1.82000000000017 | 1 | 2 | 3 |
| -1.81000000000017 | 1 | 2 | 3 |
| -1.80000000000017 | 1 | 2 | 3 |
| -1.79000000000017 | 1 | 2 | 3 |
| -1.78000000000017 | 1 | 2 | 3 |
| -1.77000000000017 | 1 | 2 | 3 |
| -1.76000000000017 | 1 | 2 | 3 |
| -1.75000000000017 | 1 | 2 | 3 |
| -1.74000000000017 | 1 | 2 | 3 |
| -1.73000000000017 | 1 | 2 | 3 |
| -1.72000000000017 | 1 | 2 | 3 |
| -1.71000000000017 | 1 | 2 | 3 |
| -1.70000000000017 | 1 | 2 | 3 |
| -1.69000000000017 | 1 | 2 | 3 |
| -1.68000000000017 | 1 | 2 | 3 |
| -1.67000000000017 | 1 | 2 | 3 |
| -1.66000000000017 | 1 | 2 | 3 |
| -1.65000000000017 | 1 | 2 | 3 |
| -1.64000000000017 | 1 | 2 | 3 |
| -1.63000000000017 | 1 | 2 | 3 |
| -1.62000000000017 | 1 | 2 | 3 |
| -1.61000000000017 | 1 | 2 | 3 |
| -1.60000000000017 | 1 | 2 | 3 |
| -1.59000000000017 | 1 | 2 | 3 |
| -1.58000000000017 | 1 | 2 | 3 |
| -1.57000000000017 | 1 | 2 | 3 |
| -1.56000000000017 | 1 | 2 | 3 |
| -1.55000000000017 | 1 | 2 | 3 |
| -1.54000000000017 | 1 | 2 | 3 |
| -1.53000000000017 | 1 | 2 | 3 |
| -1.52000000000017 | 1 | 2 | 3 |
| -1.51000000000017 | 1 | 2 | 3 |
| -1.50000000000017 | 1 | 2 | 3 |
| -1.49000000000017 | 1 | 2 | 3 |
| -1.48000000000017 | 1 | 2 | 3 |
| -1.47000000000017 | 1 | 2 | 3 |
| -1.46000000000017 | 1 | 2 | 3 |
| -1.45000000000017 | 1 | 2 | 3 |
| -1.44000000000017 | 1 | 2 | 3 |
| -1.43000000000017 | 1 | 2 | 3 |
| -1.42000000000017 | 1 | 2 | 3 |
| -1.41000000000017 | 1 | 2 | 3 |
| -1.40000000000017 | 1 | 2 | 3 |
| -1.39000000000017 | 1 | 2 | 3 |
| -1.38000000000017 | 1 | 2 | 3 |
| -1.37000000000017 | 1 | 2 | 3 |
| -1.36000000000017 | 1 | 2 | 3 |
| -1.35000000000017 | 1 | 2 | 3 |
| -1.34000000000017 | 1 | 2 | 3 |
| -1.33000000000017 | 1 | 2 | 3 |
| -1.32000000000017 | 1 | 2 | 3 |
| -1.31000000000017 | 1 | 2 | 3 |
| -1.30000000000017 | 1 | 2 | 3 |
| -1.29000000000017 | 1 | 2 | 3 |
| -1.28000000000017 | 1 | 2 | 3 |
| -1.27000000000017 | 1 | 2 | 3 |
| -1.26000000000017 | 1 | 2 | 3 |
| -1.25000000000017 | 1 | 2 | 3 |
| -1.24000000000017 | 1 | 2 | 3 |
| -1.23000000000017 | 1 | 2 | 3 |
| -1.22000000000017 | 1 | 2 | 3 |
| -1.21000000000017 | 1 | 2 | 3 |
| -1.20000000000017 | 1 | 2 | 3 |
| -1.19000000000017 | 1 | 2 | 3 |
| -1.18000000000017 | 1 | 2 | 3 |
| -1.17000000000017 | 1 | 2 | 3 |
| -1.16000000000017 | 1 | 2 | 3 |
| -1.15000000000017 | 1 | 2 | 3 |
| -1.14000000000017 | 1 | 2 | 3 |
| -1.13000000000017 | 1 | 2 | 3 |
| -1.12000000000017 | 1 | 2 | 3 |
| -1.11000000000017 | 1 | 2 | 3 |
| -1.10000000000017 | 1 | 2 | 3 |
| -1.09000000000017 | 1 | 2 | 3 |
| -1.08000000000017 | 1 | 2 | 3 |
| -1.07000000000017 | 1 | 2 | 3 |
| -1.06000000000017 | 1 | 2 | 3 |
| -1.05000000000017 | 1 | 2 | 3 |
| -1.04000000000017 | 1 | 2 | 3 |
| -1.03000000000017 | 1 | 2 | 3 |
| -1.02000000000017 | 1 | 2 | 3 |
| -1.01000000000017 | 1 | 2 | 3 |
| -1.00000000000017 | 1 | 2 | 3 |
| -0.99000000000017 | 1 | 2 | 3 |
| -0.98000000000017 | 1 | 2 | 3 |
| -0.97000000000017 | 1 | 2 | 3 |
| -0.96000000000017 | 1 | 2 | 3 |
| -0.95000000000017 | 1 | 2 | 3 |
| -0.94000000000017 | 1 | 2 | 3 |
| -0.93000000000017 | 1 | 2 | 3 |
| -0.92000000000017 | 1 | 2 | 3 |
| -0.91000000000017 | 1 | 2 | 3 |
| -0.90000000000017 | 1 | 2 | 3 |
| -0.890000000000169 | 1 | 2 | 3 |
| -0.880000000000169 | 1 | 2 | 3 |
| -0.870000000000169 | 1 | 2 | 3 |
| -0.860000000000169 | 1 | 2 | 3 |
| -0.850000000000169 | 1 | 2 | 3 |
| -0.840000000000169 | 1 | 2 | 3 |
| -0.830000000000169 | 1 | 2 | 3 |
| -0.820000000000169 | 1 | 2 | 3 |
| -0.810000000000169 | 1 | 2 | 3 |
| -0.800000000000169 | 1 | 2 | 3 |
| -0.790000000000169 | 1 | 2 | 3 |
| -0.780000000000169 | 1 | 2 | 3 |
| -0.770000000000169 | 1 | 2 | 3 |
| -0.760000000000169 | 1 | 2 | 3 |
| -0.750000000000169 | 1 | 2 | 3 |
| -0.740000000000169 | 1 | 2 | 3 |
| -0.730000000000169 | 1 | 2 | 3 |
| -0.720000000000169 | 1 | 2 | 3 |
| -0.710000000000169 | 1 | 2 | 3 |
| -0.700000000000169 | 1 | 2 | 3 |
| -0.690000000000169 | 1 | 2 | 3 |
| -0.680000000000169 | 1 | 2 | 3 |
| -0.670000000000169 | 1 | 2 | 3 |
| -0.660000000000169 | 1 | 2 | 3 |
| -0.650000000000169 | 1 | 2 | 3 |
| -0.640000000000169 | 1 | 2 | 3 |
| -0.630000000000169 | 1 | 2 | 3 |
| -0.620000000000169 | 1 | 2 | 3 |
| -0.610000000000169 | 1 | 2 | 3 |
| -0.600000000000169 | 1 | 2 | 3 |
| -0.590000000000169 | 1 | 2 | 3 |
| -0.580000000000169 | 1 | 2 | 3 |
| -0.570000000000169 | 1 | 2 | 3 |
| -0.560000000000169 | 1 | 2 | 3 |
| -0.550000000000169 | 1 | 2 | 3 |
| -0.540000000000169 | 1 | 2 | 3 |
| -0.530000000000169 | 1 | 2 | 3 |
| -0.520000000000169 | 1 | 2 | 3 |
| -0.510000000000169 | 1 | 2 | 3 |
| -0.500000000000169 | 1 | 2 | 3 |
| -0.490000000000169 | 1 | 2 | 3 |
| -0.480000000000169 | 1 | 2 | 3 |
| -0.470000000000169 | 1 | 2 | 3 |
| -0.460000000000169 | 1 | 2 | 3 |
| -0.450000000000169 | 1 | 2 | 3 |
| -0.440000000000169 | 1 | 2 | 3 |
| -0.430000000000169 | 1 | 2 | 3 |
| -0.420000000000169 | 1 | 2 | 3 |
| -0.410000000000169 | 1 | 2 | 3 |
| -0.400000000000169 | 1 | 2 | 3 |
| -0.390000000000169 | 1 | 2 | 3 |
| -0.380000000000169 | 1 | 2 | 3 |
| -0.370000000000169 | 1 | 2 | 3 |
| -0.360000000000169 | 1 | 2 | 3 |
| -0.350000000000169 | 1 | 2 | 3 |
| -0.340000000000169 | 1 | 2 | 3 |
| -0.330000000000169 | 1 | 2 | 3 |
| -0.320000000000169 | 1 | 2 | 3 |
| -0.310000000000169 | 1 | 2 | 3 |
| -0.300000000000169 | 1 | 2 | 3 |
| -0.290000000000169 | 1 | 2 | 3 |
| -0.280000000000169 | 1 | 2 | 3 |
| -0.270000000000169 | 1 | 2 | 3 |
| -0.260000000000169 | 1 | 2 | 3 |
| -0.250000000000169 | 1 | 2 | 3 |
| -0.240000000000169 | 1 | 2 | 3 |
| -0.230000000000169 | 1 | 2 | 3 |
| -0.220000000000169 | 1 | 2 | 3 |
| -0.210000000000169 | 1 | 2 | 3 |
| -0.200000000000169 | 1 | 2 | 3 |
| -0.190000000000169 | 1 | 2 | 3 |
| -0.180000000000169 | 1 | 2 | 3 |
| -0.170000000000169 | 1 | 2 | 3 |
| -0.160000000000169 | 1 | 2 | 3 |
| -0.150000000000169 | 1 | 2 | 3 |
| -0.140000000000169 | 1 | 2 | 3 |
| -0.130000000000169 | 1 | 2 | 3 |
| -0.120000000000169 | 1 | 2 | 3 |
| -0.110000000000169 | 1 | 2 | 3 |
| -0.100000000000169 | 1 | 2 | 3 |
| -0.0900000000001689 | 1 | 2 | 3 |
| -0.0800000000001689 | 1 | 2 | 3 |
| -0.0700000000001689 | 1 | 2 | 3 |
| -0.0600000000001689 | 1 | 2 | 3 |
| -0.0500000000001689 | 1 | 2 | 3 |
| -0.0400000000001689 | 1 | 2 | 3 |
| -0.0300000000001689 | 1 | 2 | 3 |
| -0.0200000000001689 | 1 | 2 | 3 |
| -0.0100000000001689 | 1 | 2 | 3 |
| -1.6888920817415e-13 | 1 | 2 | 3 |
| 0.00999999999983111 | 1 | 2 | 3 |
| 0.0199999999998311 | 1 | 2 | 3 |
| 0.0299999999998311 | 1 | 2 | 3 |
| 0.0399999999998311 | 1 | 2 | 3 |
| 0.0499999999998311 | 1 | 2 | 3 |
| 0.0599999999998311 | 1 | 2 | 3 |
| 0.0699999999998311 | 1 | 2 | 3 |
| 0.0799999999998311 | 1 | 2 | 3 |
| 0.0899999999998311 | 1 | 2 | 3 |
| 0.0999999999998311 | 1 | 2 | 3 |
| 0.109999999999831 | 1 | 2 | 3 |
| 0.119999999999831 | 1 | 2 | 3 |
| 0.129999999999831 | 1 | 2 | 3 |
| 0.139999999999831 | 1 | 2 | 3 |
| 0.149999999999831 | 1 | 2 | 3 |
| 0.159999999999831 | 1 | 2 | 3 |
| 0.169999999999831 | 1 | 2 | 3 |
| 0.179999999999831 | 1 | 2 | 3 |
| 0.189999999999831 | 1 | 2 | 3 |
| 0.199999999999831 | 1 | 2 | 3 |
| 0.209999999999831 | 1 | 2 | 3 |
| 0.219999999999831 | 1 | 2 | 3 |
| 0.229999999999831 | 1 | 2 | 3 |
| 0.239999999999831 | 1 | 2 | 3 |
| 0.249999999999831 | 1 | 2 | 3 |
| 0.259999999999831 | 1 | 2 | 3 |
| 0.269999999999831 | 1 | 2 | 3 |
| 0.279999999999831 | 1 | 2 | 3 |
| 0.289999999999831 | 1 | 2 | 3 |
| 0.299999999999831 | 1 | 2 | 3 |
| 0.309999999999831 | 1 | 2 | 3 |
| 0.319999999999831 | 1 | 2 | 3 |
| 0.329999999999831 | 1 | 2 | 3 |
| 0.339999999999831 | 1 | 2 | 3 |
| 0.349999999999831 | 1 | 2 | 3 |
| 0.359999999999831 | 1 | 2 | 3 |
| 0.369999999999831 | 1 | 2 | 3 |
| 0.379999999999831 | 1 | 2 | 3 |
| 0.389999999999831 | 1 | 2 | 3 |
| 0.399999999999831 | 1 | 2 | 3 |
| 0.409999999999831 | 1 | 2 | 3 |
| 0.419999999999831 | 1 | 2 | 3 |
| 0.429999999999831 | 1 | 2 | 3 |
| 0.439999999999831 | 1 | 2 | 3 |
| 0.449999999999831 | 1 | 2 | 3 |
| 0.459999999999831 | 1 | 2 | 3 |
| 0.469999999999831 | 1 | 2 | 3 |
| 0.479999999999831 | 1 | 2 | 3 |
| 0.489999999999831 | 1 | 2 | 3 |
| 0.499999999999831 | 1 | 2 | 3 |
| 0.509999999999831 | 1 | 2 | 3 |
| 0.519999999999831 | 1 | 2 | 3 |
| 0.529999999999831 | 1 | 2 | 3 |
| 0.539999999999831 | 1 | 2 | 3 |
| 0.549999999999831 | 1 | 2 | 3 |
| 0.559999999999831 | 1 | 2 | 3 |
| 0.569999999999831 | 1 | 2 | 3 |
| 0.579999999999831 | 1 | 2 | 3 |
| 0.589999999999831 | 1 | 2 | 3 |
| 0.599999999999831 | 1 | 2 | 3 |
| 0.609999999999831 | 1 | 2 | 3 |
| 0.619999999999831 | 1 | 2 | 3 |
| 0.629999999999831 | 1 | 2 | 3 |
| 0.639999999999831 | 1 | 2 | 3 |
| 0.649999999999831 | 1 | 2 | 3 |
| 0.659999999999831 | 1 | 2 | 3 |
| 0.669999999999831 | 1 | 2 | 3 |
| 0.679999999999831 | 1 | 2 | 3 |
| 0.689999999999831 | 1 | 2 | 3 |
| 0.699999999999831 | 1 | 2 | 3 |
| 0.709999999999831 | 1 | 2 | 3 |
| 0.719999999999831 | 1 | 2 | 3 |
| 0.729999999999831 | 1 | 2 | 3 |
| 0.739999999999831 | 1 | 2 | 3 |
| 0.749999999999832 | 1 | 2 | 3 |
| 0.759999999999832 | 1 | 2 | 3 |
| 0.769999999999832 | 1 | 2 | 3 |
| 0.779999999999832 | 1 | 2 | 3 |
| 0.789999999999832 | 1 | 2 | 3 |
| 0.799999999999832 | 1 | 2 | 3 |
| 0.809999999999832 | 1 | 2 | 3 |
| 0.819999999999832 | 1 | 2 | 3 |
| 0.829999999999832 | 1 | 2 | 3 |
| 0.839999999999832 | 1 | 2 | 3 |
| 0.849999999999832 | 1 | 2 | 3 |
| 0.859999999999832 | 1 | 2 | 3 |
| 0.869999999999832 | 1 | 2 | 3 |
| 0.879999999999832 | 1 | 2 | 3 |
| 0.889999999999832 | 1 | 2 | 3 |
| 0.899999999999832 | 1 | 2 | 3 |
| 0.909999999999832 | 1 | 2 | 3 |
| 0.919999999999832 | 1 | 2 | 3 |
| 0.929999999999832 | 1 | 2 | 3 |
| 0.939999999999832 | 1 | 2 | 3 |
| 0.949999999999832 | 1 | 2 | 3 |
| 0.959999999999832 | 1 | 2 | 3 |
| 0.969999999999832 | 1 | 2 | 3 |
| 0.979999999999832 | 1 | 2 | 3 |
| 0.989999999999832 | 1 | 2 | 3 |
| 0.999999999999832 | 1 | 2 | 3 |
| 1.009999999999832 | 1 | 2 | 3 |
| 1.019999999999832 | 1 | 2 | 3 |
| 1.029999999999832 | 1 | 2 | 3 |
| 1.039999999999832 | 1 | 2 | 3 |
| 1.049999999999832 | 1 | 2 | 3 |
| 1.059999999999832 | 1 | 2 | 3 |
| 1.069999999999832 | 1 | 2 | 3 |
| 1.079999999999832 | 1 | 2 | 3 |
| 1.089999999999832 | 1 | 2 | 3 |
| 1.099999999999832 | 1 | 2 | 3 |
| 1.109999999999832 | 1 | 2 | 3 |
| 1.119999999999832 | 1 | 2 | 3 |
| 1.129999999999832 | 1 | 2 | 3 |
| 1.139999999999832 | 1 | 2 | 3 |
| 1.149999999999832 | 1 | 2 | 3 |
| 1.159999999999832 | 1 | 2 | 3 |
| 1.169999999999832 | 1 | 2 | 3 |
| 1.179999999999832 | 1 | 2 | 3 |
| 1.189999999999832 | 1 | 2 | 3 |
| 1.199999999999832 | 1 | 2 | 3 |
| 1.209999999999832 | 1 | 2 | 3 |
| 1.219999999999832 | 1 | 2 | 3 |
| 1.229999999999832 | 1 | 2 | 3 |
| 1.239999999999832 | 1 | 2 | 3 |
| 1.249999999999832 | 1 | 2 | 3 |
| 1.259999999999832 | 1 | 2 | 3 |
| 1.269999999999832 | 1 | 2 | 3 |
| 1.279999999999832 | 1 | 2 | 3 |
| 1.289999999999832 | 1 | 2 | 3 |
| 1.299999999999832 | 1 | 2 | 3 |
| 1.309999999999832 | 1 | 2 | 3 |
| 1.319999999999832 | 1 | 2 | 3 |
| 1.329999999999832 | 1 | 2 | 3 |
| 1.339999999999832 | 1 | 2 | 3 |
| 1.349999999999832 | 1 | 2 | 3 |
| 1.359999999999832 | 1 | 2 | 3 |
| 1.369999999999832 | 1 | 2 | 3 |
| 1.379999999999832 | 1 | 2 | 3 |
| 1.389999999999832 | 1 | 2 | 3 |
| 1.399999999999832 | 1 | 2 | 3 |
| 1.409999999999832 | 1 | 2 | 3 |
| 1.419999999999832 | 1 | 2 | 3 |
| 1.429999999999832 | 1 | 2 | 3 |
| 1.439999999999832 | 1 | 2 | 3 |
| 1.449999999999832 | 1 | 2 | 3 |
| 1.459999999999832 | 1 | 2 | 3 |
| 1.469999999999832 | 1 | 2 | 3 |
| 1.479999999999832 | 1 | 2 | 3 |
| 1.489999999999832 | 1 | 2 | 3 |
| 1.499999999999832 | 1 | 2 | 3 |
| 1.509999999999832 | 1 | 2 | 3 |
| 1.519999999999832 | 1 | 2 | 3 |
| 1.529999999999832 | 1 | 2 | 3 |
| 1.539999999999832 | 1 | 2 | 3 |
| 1.549999999999832 | 1 | 2 | 3 |
| 1.559999999999832 | 1 | 2 | 3 |
| 1.569999999999832 | 1 | 2 | 3 |
| 1.579999999999832 | 1 | 2 | 3 |
| 1.589999999999832 | 1 | 2 | 3 |
| 1.599999999999832 | 1 | 2 | 3 |
| 1.609999999999832 | 1 | 2 | 3 |
| 1.619999999999832 | 1 | 2 | 3 |
| 1.629999999999832 | 1 | 2 | 3 |
| 1.639999999999832 | 1 | 2 | 3 |
| 1.649999999999832 | 1 | 2 | 3 |
| 1.659999999999832 | 1 | 2 | 3 |
| 1.669999999999832 | 1 | 2 | 3 |
| 1.679999999999832 | 1 | 2 | 3 |
| 1.689999999999832 | 1 | 2 | 3 |
| 1.699999999999832 | 1 | 2 | 3 |
| 1.709999999999832 | 1 | 2 | 3 |
| 1.719999999999832 | 1 | 2 | 3 |
| 1.729999999999832 | 1 | 2 | 3 |
| 1.739999999999832 | 1 | 2 | 3 |
| 1.749999999999832 | 1 | 2 | 3 |
| 1.759999999999832 | 1 | 2 | 3 |
| 1.769999999999832 | 1 | 2 | 3 |
| 1.779999999999832 | 1 | 2 | 3 |
| 1.789999999999832 | 1 | 2 | 3 |
| 1.799999999999832 | 1 | 2 | 3 |
| 1.809999999999832 | 1 | 2 | 3 |
| 1.819999999999832 | 1 | 2 | 3 |
| 1.829999999999832 | 1 | 2 | 3 |
| 1.839999999999832 | 1 | 2 | 3 |
| 1.849999999999832 | 1 | 2 | 3 |
| 1.859999999999832 | 1 | 2 | 3 |
| 1.869999999999832 | 1 | 2 | 3 |
| 1.879999999999832 | 1 | 2 | 3 |
| 1.889999999999832 | 1 | 2 | 3 |
| 1.899999999999832 | 1 | 2 | 3 |
| 1.909999999999832 | 1 | 2 | 3 |
| 1.919999999999832 | 1 | 2 | 3 |
| 1.929999999999832 | 1 | 2 | 3 |
| 1.939999999999832 | 1 | 2 | 3 |
| 1.949999999999833 | 1 | 2 | 3 |
| 1.959999999999833 | 1 | 2 | 3 |
| 1.969999999999833 | 1 | 2 | 3 |
| 1.979999999999833 | 1 | 2 | 3 |
| 1.989999999999833 | 1 | 2 | 3 |
| 1.999999999999833 | 1 | 2 | 3 |
| 2.009999999999832 | 1 | 2 | 3 |
| 2.019999999999832 | 1 | 2 | 3 |
| 2.029999999999832 | 1 | 2 | 3 |
| 2.039999999999832 | 1 | 2 | 3 |
| 2.049999999999832 | 1 | 2 | 3 |
| 2.059999999999831 | 1 | 2 | 3 |
| 2.069999999999831 | 1 | 2 | 3 |
| 2.079999999999831 | 1 | 2 | 3 |
| 2.089999999999831 | 1 | 2 | 3 |
| 2.09999999999983 | 1 | 2 | 3 |
| 2.10999999999983 | 1 | 2 | 3 |
| 2.11999999999983 | 1 | 2 | 3 |
| 2.12999999999983 | 1 | 2 | 3 |
| 2.13999999999983 | 1 | 2 | 3 |
| 2.149999999999829 | 1 | 2 | 3 |
| 2.159999999999829 | 1 | 2 | 3 |
| 2.169999999999829 | 1 | 2 | 3 |
| 2.179999999999829 | 1 | 2 | 3 |
| 2.189999999999829 | 1 | 2 | 3 |
| 2.199999999999828 | 1 | 2 | 3 |
| 2.209999999999828 | 1 | 2 | 3 |
| 2.219999999999828 | 1 | 2 | 3 |
| 2.229999999999828 | 1 | 2 | 3 |
| 2.239999999999827 | 1 | 2 | 3 |
| 2.249999999999827 | 1 | 2 | 3 |
| 2.259999999999827 | 1 | 2 | 3 |
| 2.269999999999827 | 1 | 2 | 3 |
| 2.279999999999827 | 1 | 2 | 3 |
| 2.289999999999826 | 1 | 2 | 3 |
| 2.299999999999826 | 1 | 2 | 3 |
| 2.309999999999826 | 1 | 2 | 3 |
| 2.319999999999826 | 1 | 2 | 3 |
| 2.329999999999825 | 1 | 2 | 3 |
| 2.339999999999825 | 1 | 2 | 3 |
| 2.349999999999825 | 1 | 2 | 3 |
| 2.359999999999825 | 1 | 2 | 3 |
| 2.369999999999825 | 1 | 2 | 3 |
| 2.379999999999824 | 1 | 2 | 3 |
| 2.389999999999824 | 1 | 2 | 3 |
| 2.399999999999824 | 1 | 2 | 3 |
| 2.409999999999824 | 1 | 2 | 3 |
| 2.419999999999824 | 1 | 2 | 3 |
| 2.429999999999823 | 1 | 2 | 3 |
| 2.439999999999823 | 1 | 2 | 3 |
| 2.449999999999823 | 1 | 2 | 3 |
| 2.459999999999823 | 1 | 2 | 3 |
| 2.469999999999823 | 1 | 2 | 3 |
| 2.479999999999822 | 1 | 2 | 3 |
| 2.489999999999822 | 1 | 2 | 3 |
| 2.499999999999822 | 1 | 2 | 3 |
| 2.509999999999822 | 1 | 2 | 3 |
| 2.519999999999821 | 1 | 2 | 3 |
| 2.529999999999821 | 1 | 2 | 3 |
| 2.539999999999821 | 1 | 2 | 3 |
| 2.549999999999821 | 1 | 2 | 3 |
| 2.559999999999821 | 1 | 2 | 3 |
| 2.56999999999982 | 1 | 2 | 3 |
| 2.57999999999982 | 1 | 2 | 3 |
| 2.58999999999982 | 1 | 2 | 3 |
| 2.59999999999982 | 1 | 2 | 3 |
| 2.609999999999819 | 1 | 2 | 3 |
| 2.619999999999819 | 1 | 2 | 3 |
| 2.629999999999819 | 1 | 2 | 3 |
| 2.639999999999819 | 1 | 2 | 3 |
| 2.649999999999819 | 1 | 2 | 3 |
| 2.659999999999818 | 1 | 2 | 3 |
| 2.669999999999818 | 1 | 2 | 3 |
| 2.679999999999818 | 1 | 2 | 3 |
| 2.689999999999818 | 1 | 2 | 3 |
| 2.699999999999818 | 1 | 2 | 3 |
| 2.709999999999817 | 1 | 2 | 3 |
| 2.719999999999817 | 1 | 2 | 3 |
| 2.729999999999817 | 1 | 2 | 3 |
| 2.739999999999817 | 1 | 2 | 3 |
| 2.749999999999817 | 1 | 2 | 3 |
| 2.759999999999816 | 1 | 2 | 3 |
| 2.769999999999816 | 1 | 2 | 3 |
| 2.779999999999816 | 1 | 2 | 3 |
| 2.789999999999816 | 1 | 2 | 3 |
| 2.799999999999815 | 1 | 2 | 3 |
| 2.809999999999815 | 1 | 2 | 3 |
| 2.819999999999815 | 1 | 2 | 3 |
| 2.829999999999815 | 1 | 2 | 3 |
| 2.839999999999815 | 1 | 2 | 3 |
| 2.849999999999814 | 1 | 2 | 3 |
| 2.859999999999814 | 1 | 2 | 3 |
| 2.869999999999814 | 1 | 2 | 3 |
| 2.879999999999814 | 1 | 2 | 3 |
| 2.889999999999814 | 1 | 2 | 3 |
| 2.899999999999813 | 1 | 2 | 3 |
| 2.909999999999813 | 1 | 2 | 3 |
| 2.919999999999813 | 1 | 2 | 3 |
| 2.929999999999813 | 1 | 2 | 3 |
| 2.939999999999813 | 1 | 2 | 3 |
| 2.949999999999812 | 1 | 2 | 3 |
| 2.959999999999812 | 1 | 2 | 3 |
| 2.969999999999812 | 1 | 2 | 3 |
| 2.979999999999812 | 1 | 2 | 3 |
| 2.989999999999811 | 1 | 2 | 3 |
| 2.999999999999811 | 1 | 2 | 3 |
| 3.009999999999811 | 1 | 2 | 3 |
| 3.019999999999811 | 1 | 2 | 3 |
| 3.029999999999811 | 1 | 2 | 3 |
| 3.03999999999981 | 1 | 2 | 3 |
| 3.04999999999981 | 1 | 2 | 3 |
| 3.05999999999981 | 1 | 2 | 3 |
| 3.06999999999981 | 1 | 2 | 3 |
| 3.07999999999981 | 1 | 2 | 3 |
| 3.089999999999809 | 1 | 2 | 3 |
| 3.099999999999809 | 1 | 2 | 3 |
| 3.109999999999809 | 1 | 2 | 3 |
| 3.119999999999809 | 1 | 2 | 3 |
| 3.129999999999808 | 1 | 2 | 3 |
| 3.139999999999808 | 1 | 2 | 3 |
| 3.149999999999808 | 1 | 2 | 3 |
| 3.159999999999808 | 1 | 2 | 3 |
| 3.169999999999808 | 1 | 2 | 3 |
| 3.179999999999807 | 1 | 2 | 3 |
| 3.189999999999807 | 1 | 2 | 3 |
| 3.199999999999807 | 1 | 2 | 3 |
| 3.209999999999807 | 1 | 2 | 3 |
| 3.219999999999807 | 1 | 2 | 3 |
| 3.229999999999806 | 1 | 2 | 3 |
| 3.239999999999806 | 1 | 2 | 3 |
| 3.249999999999806 | 1 | 2 | 3 |
| 3.259999999999806 | 1 | 2 | 3 |
| 3.269999999999805 | 1 | 2 | 3 |
| 3.279999999999805 | 1 | 2 | 3 |
| 3.289999999999805 | 1 | 2 | 3 |
| 3.299999999999805 | 1 | 2 | 3 |
| 3.309999999999805 | 1 | 2 | 3 |
| 3.319999999999804 | 1 | 2 | 3 |
| 3.329999999999804 | 1 | 2 | 3 |
| 3.339999999999804 | 1 | 2 | 3 |
| 3.349999999999804 | 1 | 2 | 3 |
| 3.359999999999804 | 1 | 2 | 3 |
| 3.369999999999803 | 1 | 2 | 3 |
| 3.379999999999803 | 1 | 2 | 3 |
| 3.389999999999803 | 1 | 2 | 3 |
| 3.399999999999803 | 1 | 2 | 3 |
| 3.409999999999802 | 1 | 2 | 3 |
| 3.419999999999802 | 1 | 2 | 3 |
| 3.429999999999802 | 1 | 2 | 3 |
| 3.439999999999802 | 1 | 2 | 3 |
| 3.449999999999802 | 1 | 2 | 3 |
| 3.459999999999801 | 1 | 2 | 3 |
| 3.469999999999801 | 1 | 2 | 3 |
| 3.479999999999801 | 1 | 2 | 3 |
| 3.489999999999801 | 1 | 2 | 3 |
| 3.499999999999801 | 1 | 2 | 3 |
| 3.5099999999998 | 1 | 2 | 3 |
| 3.5199999999998 | 1 | 2 | 3 |
| 3.5299999999998 | 1 | 2 | 3 |
| 3.5399999999998 | 1 | 2 | 3 |
| 3.5499999999998 | 1 | 2 | 3 |
| 3.559999999999799 | 1 | 2 | 3 |
| 3.569999999999799 | 1 | 2 | 3 |
| 3.579999999999799 | 1 | 2 | 3 |
| 3.589999999999799 | 1 | 2 | 3 |
| 3.599999999999798 | 1 | 2 | 3 |
| 3.609999999999798 | 1 | 2 | 3 |
| 3.619999999999798 | 1 | 2 | 3 |
| 3.629999999999798 | 1 | 2 | 3 |
| 3.639999999999798 | 1 | 2 | 3 |
| 3.649999999999797 | 1 | 2 | 3 |
| 3.659999999999797 | 1 | 2 | 3 |
| 3.669999999999797 | 1 | 2 | 3 |
| 3.679999999999797 | 1 | 2 | 3 |
| 3.689999999999796 | 1 | 2 | 3 |
| 3.699999999999796 | 1 | 2 | 3 |
| 3.709999999999796 | 1 | 2 | 3 |
| 3.719999999999796 | 1 | 2 | 3 |
| 3.729999999999796 | 1 | 2 | 3 |
| 3.739999999999795 | 1 | 2 | 3 |
| 3.749999999999795 | 1 | 2 | 3 |
| 3.759999999999795 | 1 | 2 | 3 |
| 3.769999999999795 | 1 | 2 | 3 |
| 3.779999999999795 | 1 | 2 | 3 |
| 3.789999999999794 | 1 | 2 | 3 |
| 3.799999999999794 | 1 | 2 | 3 |
| 3.809999999999794 | 1 | 2 | 3 |
| 3.819999999999794 | 1 | 2 | 3 |
| 3.829999999999794 | 1 | 2 | 3 |
| 3.839999999999793 | 1 | 2 | 3 |
| 3.849999999999793 | 1 | 2 | 3 |
| 3.859999999999793 | 1 | 2 | 3 |
| 3.869999999999793 | 1 | 2 | 3 |
| 3.879999999999792 | 1 | 2 | 3 |
| 3.889999999999792 | 1 | 2 | 3 |
| 3.899999999999792 | 1 | 2 | 3 |
| 3.909999999999792 | 1 | 2 | 3 |
| 3.919999999999792 | 1 | 2 | 3 |
| 3.929999999999791 | 1 | 2 | 3 |
| 3.939999999999791 | 1 | 2 | 3 |
| 3.949999999999791 | 1 | 2 | 3 |
| 3.959999999999791 | 1 | 2 | 3 |
| 3.969999999999791 | 1 | 2 | 3 |
| 3.97999999999979 | 1 | 2 | 3 |
| 3.98999999999979 | 1 | 2 | 3 |
| 3.99999999999979 | 1 | 2 | 3 |
| 4.00999999999979 | 1 | 2 | 3 |
| 4.01999999999979 | 1 | 2 | 3 |
| 4.02999999999979 | 1 | 2 | 3 |
| 4.03999999999979 | 1 | 2 | 3 |
| 4.04999999999979 | 1 | 2 | 3 |
| 4.05999999999979 | 1 | 2 | 3 |
| 4.069999999999789 | 1 | 2 | 3 |
| 4.079999999999788 | 1 | 2 | 3 |
| 4.089999999999788 | 1 | 2 | 3 |
| 4.099999999999788 | 1 | 2 | 3 |
| 4.109999999999788 | 1 | 2 | 3 |
| 4.119999999999788 | 1 | 2 | 3 |
| 4.129999999999788 | 1 | 2 | 3 |
| 4.139999999999787 | 1 | 2 | 3 |
| 4.149999999999787 | 1 | 2 | 3 |
| 4.159999999999787 | 1 | 2 | 3 |
| 4.169999999999787 | 1 | 2 | 3 |
| 4.179999999999786 | 1 | 2 | 3 |
| 4.189999999999786 | 1 | 2 | 3 |
| 4.199999999999786 | 1 | 2 | 3 |
| 4.209999999999785 | 1 | 2 | 3 |
| 4.219999999999785 | 1 | 2 | 3 |
| 4.229999999999785 | 1 | 2 | 3 |
| 4.239999999999785 | 1 | 2 | 3 |
| 4.249999999999785 | 1 | 2 | 3 |
| 4.259999999999784 | 1 | 2 | 3 |
| 4.269999999999784 | 1 | 2 | 3 |
| 4.279999999999784 | 1 | 2 | 3 |
| 4.289999999999784 | 1 | 2 | 3 |
| 4.299999999999784 | 1 | 2 | 3 |
| 4.309999999999784 | 1 | 2 | 3 |
| 4.319999999999784 | 1 | 2 | 3 |
| 4.329999999999783 | 1 | 2 | 3 |
| 4.339999999999783 | 1 | 2 | 3 |
| 4.349999999999783 | 1 | 2 | 3 |
| 4.359999999999783 | 1 | 2 | 3 |
| 4.369999999999782 | 1 | 2 | 3 |
| 4.379999999999782 | 1 | 2 | 3 |
| 4.389999999999782 | 1 | 2 | 3 |
| 4.399999999999782 | 1 | 2 | 3 |
| 4.409999999999781 | 1 | 2 | 3 |
| 4.419999999999781 | 1 | 2 | 3 |
| 4.429999999999781 | 1 | 2 | 3 |
| 4.43999999999978 | 1 | 2 | 3 |
| 4.44999999999978 | 1 | 2 | 3 |
| 4.45999999999978 | 1 | 2 | 3 |
| 4.46999999999978 | 1 | 2 | 3 |
| 4.47999999999978 | 1 | 2 | 3 |
| 4.48999999999978 | 1 | 2 | 3 |
| 4.49999999999978 | 1 | 2 | 3 |
| 4.50999999999978 | 1 | 2 | 3 |
| 4.51999999999978 | 1 | 2 | 3 |
| 4.52999999999978 | 1 | 2 | 3 |
| 4.539999999999778 | 1 | 2 | 3 |
| 4.549999999999778 | 1 | 2 | 3 |
| 4.559999999999778 | 1 | 2 | 3 |
| 4.569999999999778 | 1 | 2 | 3 |
| 4.579999999999778 | 1 | 2 | 3 |
| 4.589999999999777 | 1 | 2 | 3 |
| 4.599999999999777 | 1 | 2 | 3 |
| 4.609999999999777 | 1 | 2 | 3 |
| 4.619999999999777 | 1 | 2 | 3 |
| 4.629999999999777 | 1 | 2 | 3 |
| 4.639999999999776 | 1 | 2 | 3 |
| 4.649999999999776 | 1 | 2 | 3 |
| 4.659999999999776 | 1 | 2 | 3 |
| 4.669999999999776 | 1 | 2 | 3 |
| 4.679999999999775 | 1 | 2 | 3 |
| 4.689999999999775 | 1 | 2 | 3 |
| 4.699999999999775 | 1 | 2 | 3 |
| 4.709999999999775 | 1 | 2 | 3 |
| 4.719999999999774 | 1 | 2 | 3 |
| 4.729999999999774 | 1 | 2 | 3 |
| 4.739999999999774 | 1 | 2 | 3 |
| 4.749999999999774 | 1 | 2 | 3 |
| 4.759999999999774 | 1 | 2 | 3 |
| 4.769999999999774 | 1 | 2 | 3 |
| 4.779999999999773 | 1 | 2 | 3 |
| 4.789999999999773 | 1 | 2 | 3 |
| 4.799999999999773 | 1 | 2 | 3 |
| 4.809999999999773 | 1 | 2 | 3 |
| 4.819999999999773 | 1 | 2 | 3 |
| 4.829999999999773 | 1 | 2 | 3 |
| 4.839999999999772 | 1 | 2 | 3 |
| 4.849999999999772 | 1 | 2 | 3 |
| 4.859999999999772 | 1 | 2 | 3 |
| 4.869999999999772 | 1 | 2 | 3 |
| 4.879999999999771 | 1 | 2 | 3 |
| 4.889999999999771 | 1 | 2 | 3 |
| 4.899999999999771 | 1 | 2 | 3 |
| 4.90999999999977 | 1 | 2 | 3 |
| 4.91999999999977 | 1 | 2 | 3 |
| 4.92999999999977 | 1 | 2 | 3 |
| 4.93999999999977 | 1 | 2 | 3 |
| 4.94999999999977 | 1 | 2 | 3 |
| 4.95999999999977 | 1 | 2 | 3 |
| 4.96999999999977 | 1 | 2 | 3 |
| 4.97999999999977 | 1 | 2 | 3 |
| 4.98999999999977 | 1 | 2 | 3 |
| 4.99999999999977 | 1 | 2 | 3 |
| 5.009999999999768 | 1 | 2 | 3 |
| 5.019999999999768 | 1 | 2 | 3 |
| 5.029999999999768 | 1 | 2 | 3 |
| 5.039999999999768 | 1 | 2 | 3 |
| 5.049999999999767 | 1 | 2 | 3 |
| 5.059999999999767 | 1 | 2 | 3 |
| 5.069999999999767 | 1 | 2 | 3 |
| 5.079999999999767 | 1 | 2 | 3 |
| 5.089999999999767 | 1 | 2 | 3 |
| 5.099999999999766 | 1 | 2 | 3 |
| 5.109999999999766 | 1 | 2 | 3 |
| 5.119999999999766 | 1 | 2 | 3 |
| 5.129999999999766 | 1 | 2 | 3 |
| 5.139999999999766 | 1 | 2 | 3 |
| 5.149999999999765 | 1 | 2 | 3 |
| 5.159999999999765 | 1 | 2 | 3 |
| 5.169999999999765 | 1 | 2 | 3 |
| 5.179999999999765 | 1 | 2 | 3 |
| 5.189999999999764 | 1 | 2 | 3 |
| 5.199999999999764 | 1 | 2 | 3 |
| 5.209999999999764 | 1 | 2 | 3 |
| 5.219999999999764 | 1 | 2 | 3 |
| 5.229999999999764 | 1 | 2 | 3 |
| 5.239999999999763 | 1 | 2 | 3 |
| 5.249999999999763 | 1 | 2 | 3 |
| 5.259999999999763 | 1 | 2 | 3 |
| 5.269999999999763 | 1 | 2 | 3 |
| 5.279999999999763 | 1 | 2 | 3 |
| 5.289999999999762 | 1 | 2 | 3 |
| 5.299999999999762 | 1 | 2 | 3 |
| 5.309999999999762 | 1 | 2 | 3 |
| 5.319999999999762 | 1 | 2 | 3 |
| 5.329999999999762 | 1 | 2 | 3 |
| 5.339999999999761 | 1 | 2 | 3 |
| 5.349999999999761 | 1 | 2 | 3 |
| 5.359999999999761 | 1 | 2 | 3 |
| 5.369999999999761 | 1 | 2 | 3 |
| 5.37999999999976 | 1 | 2 | 3 |
| 5.38999999999976 | 1 | 2 | 3 |
| 5.39999999999976 | 1 | 2 | 3 |
| 5.40999999999976 | 1 | 2 | 3 |
| 5.41999999999976 | 1 | 2 | 3 |
| 5.42999999999976 | 1 | 2 | 3 |
| 5.43999999999976 | 1 | 2 | 3 |
| 5.44999999999976 | 1 | 2 | 3 |
| 5.45999999999976 | 1 | 2 | 3 |
| 5.46999999999976 | 1 | 2 | 3 |
| 5.479999999999758 | 1 | 2 | 3 |
| 5.489999999999758 | 1 | 2 | 3 |
| 5.499999999999758 | 1 | 2 | 3 |
| 5.509999999999758 | 1 | 2 | 3 |
| 5.519999999999758 | 1 | 2 | 3 |
| 5.529999999999758 | 1 | 2 | 3 |
| 5.539999999999757 | 1 | 2 | 3 |
| 5.549999999999757 | 1 | 2 | 3 |
| 5.559999999999757 | 1 | 2 | 3 |
| 5.569999999999757 | 1 | 2 | 3 |
| 5.579999999999756 | 1 | 2 | 3 |
| 5.589999999999756 | 1 | 2 | 3 |
| 5.599999999999756 | 1 | 2 | 3 |
| 5.609999999999756 | 1 | 2 | 3 |
| 5.619999999999756 | 1 | 2 | 3 |
| 5.629999999999756 | 1 | 2 | 3 |
| 5.639999999999755 | 1 | 2 | 3 |
| 5.649999999999755 | 1 | 2 | 3 |
| 5.659999999999755 | 1 | 2 | 3 |
| 5.669999999999755 | 1 | 2 | 3 |
| 5.679999999999754 | 1 | 2 | 3 |
| 5.689999999999754 | 1 | 2 | 3 |
| 5.699999999999754 | 1 | 2 | 3 |
| 5.709999999999754 | 1 | 2 | 3 |
| 5.719999999999754 | 1 | 2 | 3 |
| 5.729999999999753 | 1 | 2 | 3 |
| 5.739999999999753 | 1 | 2 | 3 |
| 5.749999999999753 | 1 | 2 | 3 |
| 5.759999999999753 | 1 | 2 | 3 |
| 5.769999999999753 | 1 | 2 | 3 |
| 5.779999999999752 | 1 | 2 | 3 |
| 5.789999999999752 | 1 | 2 | 3 |
| 5.799999999999752 | 1 | 2 | 3 |
| 5.809999999999752 | 1 | 2 | 3 |
| 5.819999999999752 | 1 | 2 | 3 |
| 5.829999999999751 | 1 | 2 | 3 |
| 5.839999999999751 | 1 | 2 | 3 |
| 5.849999999999751 | 1 | 2 | 3 |
| 5.859999999999751 | 1 | 2 | 3 |
| 5.86999999999975 | 1 | 2 | 3 |
| 5.87999999999975 | 1 | 2 | 3 |
| 5.88999999999975 | 1 | 2 | 3 |
| 5.89999999999975 | 1 | 2 | 3 |
| 5.90999999999975 | 1 | 2 | 3 |
| 5.91999999999975 | 1 | 2 | 3 |
| 5.92999999999975 | 1 | 2 | 3 |
| 5.93999999999975 | 1 | 2 | 3 |
| 5.949999999999748 | 1 | 2 | 3 |
| 5.959999999999748 | 1 | 2 | 3 |
| 5.969999999999748 | 1 | 2 | 3 |
| 5.979999999999748 | 1 | 2 | 3 |
| 5.989999999999747 | 1 | 2 | 3 |
| 5.999999999999747 | 1 | 2 | 3 |
| 6.009999999999747 | 1 | 2 | 3 |
| 6.019999999999747 | 1 | 2 | 3 |
| 6.029999999999747 | 1 | 2 | 3 |
| 6.039999999999746 | 1 | 2 | 3 |
| 6.049999999999746 | 1 | 2 | 3 |
| 6.059999999999746 | 1 | 2 | 3 |
| 6.069999999999746 | 1 | 2 | 3 |
| 6.079999999999746 | 1 | 2 | 3 |
| 6.089999999999745 | 1 | 2 | 3 |
| 6.099999999999745 | 1 | 2 | 3 |
| 6.109999999999745 | 1 | 2 | 3 |
| 6.119999999999745 | 1 | 2 | 3 |
| 6.129999999999745 | 1 | 2 | 3 |
| 6.139999999999744 | 1 | 2 | 3 |
| 6.149999999999744 | 1 | 2 | 3 |
| 6.159999999999744 | 1 | 2 | 3 |
| 6.169999999999744 | 1 | 2 | 3 |
| 6.179999999999744 | 1 | 2 | 3 |
| 6.189999999999744 | 1 | 2 | 3 |
| 6.199999999999743 | 1 | 2 | 3 |
| 6.209999999999743 | 1 | 2 | 3 |
| 6.219999999999743 | 1 | 2 | 3 |
| 6.229999999999743 | 1 | 2 | 3 |
| 6.239999999999742 | 1 | 2 | 3 |
| 6.249999999999742 | 1 | 2 | 3 |
| 6.259999999999742 | 1 | 2 | 3 |
| 6.269999999999742 | 1 | 2 | 3 |
| 6.279999999999741 | 1 | 2 | 3 |
| 6.289999999999741 | 1 | 2 | 3 |
| 6.299999999999741 | 1 | 2 | 3 |
| 6.309999999999741 | 1 | 2 | 3 |
| 6.319999999999741 | 1 | 2 | 3 |
| 6.329999999999741 | 1 | 2 | 3 |
| 6.33999999999974 | 1 | 2 | 3 |
| 6.34999999999974 | 1 | 2 | 3 |
| 6.35999999999974 | 1 | 2 | 3 |
| 6.36999999999974 | 1 | 2 | 3 |
| 6.37999999999974 | 1 | 2 | 3 |
| 6.38999999999974 | 1 | 2 | 3 |
| 6.39999999999974 | 1 | 2 | 3 |
| 6.409999999999738 | 1 | 2 | 3 |
| 6.419999999999738 | 1 | 2 | 3 |
| 6.429999999999738 | 1 | 2 | 3 |
| 6.439999999999738 | 1 | 2 | 3 |
| 6.449999999999738 | 1 | 2 | 3 |
| 6.459999999999737 | 1 | 2 | 3 |
| 6.469999999999737 | 1 | 2 | 3 |
| 6.479999999999737 | 1 | 2 | 3 |
| 6.489999999999737 | 1 | 2 | 3 |
| 6.499999999999737 | 1 | 2 | 3 |
| 6.509999999999736 | 1 | 2 | 3 |
| 6.519999999999736 | 1 | 2 | 3 |
| 6.529999999999736 | 1 | 2 | 3 |
| 6.539999999999736 | 1 | 2 | 3 |
| 6.549999999999736 | 1 | 2 | 3 |
| 6.559999999999735 | 1 | 2 | 3 |
| 6.569999999999735 | 1 | 2 | 3 |
| 6.579999999999735 | 1 | 2 | 3 |
| 6.589999999999735 | 1 | 2 | 3 |
| 6.599999999999734 | 1 | 2 | 3 |
| 6.609999999999734 | 1 | 2 | 3 |
| 6.619999999999734 | 1 | 2 | 3 |
| 6.629999999999734 | 1 | 2 | 3 |
| 6.639999999999734 | 1 | 2 | 3 |
| 6.649999999999734 | 1 | 2 | 3 |
| 6.659999999999734 | 1 | 2 | 3 |
| 6.669999999999733 | 1 | 2 | 3 |
| 6.679999999999733 | 1 | 2 | 3 |
| 6.689999999999733 | 1 | 2 | 3 |
| 6.699999999999733 | 1 | 2 | 3 |
| 6.709999999999732 | 1 | 2 | 3 |
| 6.719999999999732 | 1 | 2 | 3 |
| 6.729999999999732 | 1 | 2 | 3 |
| 6.739999999999731 | 1 | 2 | 3 |
| 6.749999999999731 | 1 | 2 | 3 |
| 6.759999999999731 | 1 | 2 | 3 |
| 6.769999999999731 | 1 | 2 | 3 |
| 6.77999999999973 | 1 | 2 | 3 |
| 6.78999999999973 | 1 | 2 | 3 |
| 6.79999999999973 | 1 | 2 | 3 |
| 6.80999999999973 | 1 | 2 | 3 |
| 6.81999999999973 | 1 | 2 | 3 |
| 6.82999999999973 | 1 | 2 | 3 |
| 6.83999999999973 | 1 | 2 | 3 |
| 6.84999999999973 | 1 | 2 | 3 |
| 6.85999999999973 | 1 | 2 | 3 |
| 6.86999999999973 | 1 | 2 | 3 |
| 6.879999999999728 | 1 | 2 | 3 |
| 6.889999999999728 | 1 | 2 | 3 |
| 6.899999999999728 | 1 | 2 | 3 |
| 6.909999999999728 | 1 | 2 | 3 |
| 6.919999999999728 | 1 | 2 | 3 |
| 6.929999999999727 | 1 | 2 | 3 |
| 6.939999999999727 | 1 | 2 | 3 |
| 6.949999999999727 | 1 | 2 | 3 |
| 6.959999999999727 | 1 | 2 | 3 |
| 6.969999999999727 | 1 | 2 | 3 |
| 6.979999999999726 | 1 | 2 | 3 |
| 6.989999999999726 | 1 | 2 | 3 |
| 6.999999999999726 | 1 | 2 | 3 |
| 7.009999999999726 | 1 | 2 | 3 |
| 7.019999999999726 | 1 | 2 | 3 |
| 7.029999999999725 | 1 | 2 | 3 |
| 7.039999999999725 | 1 | 2 | 3 |
| 7.049999999999725 | 1 | 2 | 3 |
| 7.059999999999725 | 1 | 2 | 3 |
| 7.069999999999724 | 1 | 2 | 3 |
| 7.079999999999724 | 1 | 2 | 3 |
| 7.089999999999724 | 1 | 2 | 3 |
| 7.099999999999724 | 1 | 2 | 3 |
| 7.109999999999724 | 1 | 2 | 3 |
| 7.119999999999724 | 1 | 2 | 3 |
| 7.129999999999724 | 1 | 2 | 3 |
| 7.139999999999723 | 1 | 2 | 3 |
| 7.149999999999723 | 1 | 2 | 3 |
| 7.159999999999723 | 1 | 2 | 3 |
| 7.169999999999723 | 1 | 2 | 3 |
| 7.179999999999722 | 1 | 2 | 3 |
| 7.189999999999722 | 1 | 2 | 3 |
| 7.199999999999722 | 1 | 2 | 3 |
| 7.209999999999721 | 1 | 2 | 3 |
| 7.219999999999721 | 1 | 2 | 3 |
| 7.229999999999721 | 1 | 2 | 3 |
| 7.23999999999972 | 1 | 2 | 3 |
| 7.24999999999972 | 1 | 2 | 3 |
| 7.25999999999972 | 1 | 2 | 3 |
| 7.26999999999972 | 1 | 2 | 3 |
| 7.27999999999972 | 1 | 2 | 3 |
| 7.28999999999972 | 1 | 2 | 3 |
| 7.29999999999972 | 1 | 2 | 3 |
| 7.30999999999972 | 1 | 2 | 3 |
| 7.31999999999972 | 1 | 2 | 3 |
| 7.329999999999719 | 1 | 2 | 3 |
| 7.33999999999972 | 1 | 2 | 3 |
| 7.349999999999719 | 1 | 2 | 3 |
| 7.359999999999719 | 1 | 2 | 3 |
| 7.369999999999718 | 1 | 2 | 3 |
| 7.379999999999718 | 1 | 2 | 3 |
| 7.389999999999718 | 1 | 2 | 3 |
| 7.399999999999718 | 1 | 2 | 3 |
| 7.409999999999717 | 1 | 2 | 3 |
| 7.419999999999717 | 1 | 2 | 3 |
| 7.429999999999717 | 1 | 2 | 3 |
| 7.439999999999717 | 1 | 2 | 3 |
| 7.449999999999716 | 1 | 2 | 3 |
| 7.459999999999716 | 1 | 2 | 3 |
| 7.469999999999716 | 1 | 2 | 3 |
| 7.479999999999716 | 1 | 2 | 3 |
| 7.489999999999715 | 1 | 2 | 3 |
| 7.499999999999715 | 1 | 2 | 3 |
| 7.509999999999715 | 1 | 2 | 3 |
| 7.519999999999715 | 1 | 2 | 3 |
| 7.529999999999715 | 1 | 2 | 3 |
| 7.539999999999714 | 1 | 2 | 3 |
| 7.549999999999714 | 1 | 2 | 3 |
| 7.559999999999714 | 1 | 2 | 3 |
| 7.569999999999714 | 1 | 2 | 3 |
| 7.579999999999714 | 1 | 2 | 3 |
| 7.589999999999714 | 1 | 2 | 3 |
| 7.599999999999714 | 1 | 2 | 3 |
| 7.609999999999713 | 1 | 2 | 3 |
| 7.619999999999713 | 1 | 2 | 3 |
| 7.629999999999713 | 1 | 2 | 3 |
| 7.639999999999713 | 1 | 2 | 3 |
| 7.649999999999712 | 1 | 2 | 3 |
| 7.659999999999712 | 1 | 2 | 3 |
| 7.669999999999712 | 1 | 2 | 3 |
| 7.679999999999712 | 1 | 2 | 3 |
| 7.689999999999712 | 1 | 2 | 3 |
| 7.699999999999711 | 1 | 2 | 3 |
| 7.709999999999711 | 1 | 2 | 3 |
| 7.719999999999711 | 1 | 2 | 3 |
| 7.729999999999711 | 1 | 2 | 3 |
| 7.73999999999971 | 1 | 2 | 3 |
| 7.74999999999971 | 1 | 2 | 3 |
| 7.75999999999971 | 1 | 2 | 3 |
| 7.76999999999971 | 1 | 2 | 3 |
| 7.77999999999971 | 1 | 2 | 3 |
| 7.78999999999971 | 1 | 2 | 3 |
| 7.79999999999971 | 1 | 2 | 3 |
| 7.80999999999971 | 1 | 2 | 3 |
| 7.819999999999709 | 1 | 2 | 3 |
| 7.829999999999709 | 1 | 2 | 3 |
| 7.839999999999708 | 1 | 2 | 3 |
| 7.849999999999708 | 1 | 2 | 3 |
| 7.859999999999708 | 1 | 2 | 3 |
| 7.869999999999708 | 1 | 2 | 3 |
| 7.879999999999707 | 1 | 2 | 3 |
| 7.889999999999707 | 1 | 2 | 3 |
| 7.899999999999707 | 1 | 2 | 3 |
| 7.909999999999707 | 1 | 2 | 3 |
| 7.919999999999706 | 1 | 2 | 3 |
| 7.929999999999706 | 1 | 2 | 3 |
| 7.939999999999706 | 1 | 2 | 3 |
| 7.949999999999706 | 1 | 2 | 3 |
| 7.959999999999705 | 1 | 2 | 3 |
| 7.969999999999705 | 1 | 2 | 3 |
| 7.979999999999705 | 1 | 2 | 3 |
| 7.989999999999705 | 1 | 2 | 3 |
| 7.999999999999705 | 1 | 2 | 3 |
| 8.009999999999703 | 1 | 2 | 3 |
| 8.019999999999705 | 1 | 2 | 3 |
| 8.029999999999704 | 1 | 2 | 3 |
| 8.039999999999704 | 1 | 2 | 3 |
| 8.049999999999704 | 1 | 2 | 3 |
| 8.059999999999704 | 1 | 2 | 3 |
| 8.069999999999704 | 1 | 2 | 3 |
| 8.079999999999703 | 1 | 2 | 3 |
| 8.089999999999703 | 1 | 2 | 3 |
| 8.099999999999701 | 1 | 2 | 3 |
| 8.109999999999703 | 1 | 2 | 3 |
| 8.119999999999703 | 1 | 2 | 3 |
| 8.129999999999702 | 1 | 2 | 3 |
| 8.139999999999702 | 1 | 2 | 3 |
| 8.1499999999997 | 1 | 2 | 3 |
| 8.1599999999997 | 1 | 2 | 3 |
| 8.1699999999997 | 1 | 2 | 3 |
| 8.1799999999997 | 1 | 2 | 3 |
| 8.1899999999997 | 1 | 2 | 3 |
| 8.1999999999997 | 1 | 2 | 3 |
| 8.2099999999997 | 1 | 2 | 3 |
| 8.2199999999997 | 1 | 2 | 3 |
| 8.2299999999997 | 1 | 2 | 3 |
| 8.2399999999997 | 1 | 2 | 3 |
| 8.2499999999997 | 1 | 2 | 3 |
| 8.2599999999997 | 1 | 2 | 3 |
| 8.2699999999997 | 1 | 2 | 3 |
| 8.2799999999997 | 1 | 2 | 3 |
| 8.289999999999697 | 1 | 2 | 3 |
| 8.299999999999699 | 1 | 2 | 3 |
| 8.309999999999699 | 1 | 2 | 3 |
| 8.319999999999698 | 1 | 2 | 3 |
| 8.329999999999698 | 1 | 2 | 3 |
| 8.339999999999698 | 1 | 2 | 3 |
| 8.349999999999698 | 1 | 2 | 3 |
| 8.359999999999697 | 1 | 2 | 3 |
| 8.369999999999697 | 1 | 2 | 3 |
| 8.379999999999695 | 1 | 2 | 3 |
| 8.389999999999697 | 1 | 2 | 3 |
| 8.399999999999697 | 1 | 2 | 3 |
| 8.409999999999696 | 1 | 2 | 3 |
| 8.419999999999696 | 1 | 2 | 3 |
| 8.429999999999694 | 1 | 2 | 3 |
| 8.439999999999696 | 1 | 2 | 3 |
| 8.449999999999696 | 1 | 2 | 3 |
| 8.459999999999695 | 1 | 2 | 3 |
| 8.469999999999695 | 1 | 2 | 3 |
| 8.479999999999693 | 1 | 2 | 3 |
| 8.489999999999695 | 1 | 2 | 3 |
| 8.499999999999694 | 1 | 2 | 3 |
| 8.509999999999694 | 1 | 2 | 3 |
| 8.519999999999694 | 1 | 2 | 3 |
| 8.529999999999694 | 1 | 2 | 3 |
| 8.539999999999694 | 1 | 2 | 3 |
| 8.549999999999693 | 1 | 2 | 3 |
| 8.55999999999969 | 1 | 2 | 3 |
| 8.56999999999969 | 1 | 2 | 3 |
| 8.57999999999969 | 1 | 2 | 3 |
| 8.58999999999969 | 1 | 2 | 3 |
| 8.59999999999969 | 1 | 2 | 3 |
| 8.60999999999969 | 1 | 2 | 3 |
| 8.61999999999969 | 1 | 2 | 3 |
| 8.62999999999969 | 1 | 2 | 3 |
| 8.63999999999969 | 1 | 2 | 3 |
| 8.64999999999969 | 1 | 2 | 3 |
| 8.65999999999969 | 1 | 2 | 3 |
| 8.66999999999969 | 1 | 2 | 3 |
| 8.67999999999969 | 1 | 2 | 3 |
| 8.68999999999969 | 1 | 2 | 3 |
| 8.69999999999969 | 1 | 2 | 3 |
| 8.70999999999969 | 1 | 2 | 3 |
| 8.71999999999969 | 1 | 2 | 3 |
| 8.72999999999969 | 1 | 2 | 3 |
| 8.73999999999969 | 1 | 2 | 3 |
| 8.74999999999969 | 1 | 2 | 3 |
| 8.759999999999687 | 1 | 2 | 3 |
| 8.769999999999689 | 1 | 2 | 3 |
| 8.779999999999688 | 1 | 2 | 3 |
| 8.789999999999688 | 1 | 2 | 3 |
| 8.799999999999686 | 1 | 2 | 3 |
| 8.809999999999688 | 1 | 2 | 3 |
| 8.819999999999688 | 1 | 2 | 3 |
| 8.829999999999687 | 1 | 2 | 3 |
| 8.839999999999687 | 1 | 2 | 3 |
| 8.849999999999685 | 1 | 2 | 3 |
| 8.859999999999687 | 1 | 2 | 3 |
| 8.869999999999687 | 1 | 2 | 3 |
| 8.879999999999686 | 1 | 2 | 3 |
| 8.889999999999686 | 1 | 2 | 3 |
| 8.899999999999684 | 1 | 2 | 3 |
| 8.909999999999686 | 1 | 2 | 3 |
| 8.919999999999686 | 1 | 2 | 3 |
| 8.929999999999685 | 1 | 2 | 3 |
| 8.939999999999685 | 1 | 2 | 3 |
| 8.949999999999685 | 1 | 2 | 3 |
| 8.959999999999685 | 1 | 2 | 3 |
| 8.969999999999684 | 1 | 2 | 3 |
| 8.979999999999684 | 1 | 2 | 3 |
| 8.989999999999682 | 1 | 2 | 3 |
| 8.999999999999684 | 1 | 2 | 3 |
| 9.009999999999684 | 1 | 2 | 3 |
| 9.019999999999683 | 1 | 2 | 3 |
| 9.029999999999683 | 1 | 2 | 3 |
| 9.039999999999681 | 1 | 2 | 3 |
| 9.049999999999683 | 1 | 2 | 3 |
| 9.05999999999968 | 1 | 2 | 3 |
| 9.06999999999968 | 1 | 2 | 3 |
| 9.07999999999968 | 1 | 2 | 3 |
| 9.08999999999968 | 1 | 2 | 3 |
| 9.09999999999968 | 1 | 2 | 3 |
| 9.10999999999968 | 1 | 2 | 3 |
| 9.11999999999968 | 1 | 2 | 3 |
| 9.12999999999968 | 1 | 2 | 3 |
| 9.13999999999968 | 1 | 2 | 3 |
| 9.14999999999968 | 1 | 2 | 3 |
| 9.15999999999968 | 1 | 2 | 3 |
| 9.16999999999968 | 1 | 2 | 3 |
| 9.17999999999968 | 1 | 2 | 3 |
| 9.18999999999968 | 1 | 2 | 3 |
| 9.19999999999968 | 1 | 2 | 3 |
| 9.20999999999968 | 1 | 2 | 3 |
| 9.21999999999968 | 1 | 2 | 3 |
| 9.229999999999677 | 1 | 2 | 3 |
| 9.239999999999679 | 1 | 2 | 3 |
| 9.249999999999678 | 1 | 2 | 3 |
| 9.259999999999678 | 1 | 2 | 3 |
| 9.269999999999678 | 1 | 2 | 3 |
| 9.279999999999678 | 1 | 2 | 3 |
| 9.289999999999678 | 1 | 2 | 3 |
| 9.299999999999677 | 1 | 2 | 3 |
| 9.309999999999677 | 1 | 2 | 3 |
| 9.319999999999675 | 1 | 2 | 3 |
| 9.329999999999677 | 1 | 2 | 3 |
| 9.339999999999677 | 1 | 2 | 3 |
| 9.349999999999676 | 1 | 2 | 3 |
| 9.359999999999676 | 1 | 2 | 3 |
| 9.369999999999674 | 1 | 2 | 3 |
| 9.379999999999676 | 1 | 2 | 3 |
| 9.389999999999675 | 1 | 2 | 3 |
| 9.399999999999675 | 1 | 2 | 3 |
| 9.409999999999675 | 1 | 2 | 3 |
| 9.419999999999675 | 1 | 2 | 3 |
| 9.429999999999675 | 1 | 2 | 3 |
| 9.439999999999674 | 1 | 2 | 3 |
| 9.449999999999674 | 1 | 2 | 3 |
| 9.459999999999672 | 1 | 2 | 3 |
| 9.469999999999674 | 1 | 2 | 3 |
| 9.479999999999674 | 1 | 2 | 3 |
| 9.489999999999673 | 1 | 2 | 3 |
| 9.499999999999673 | 1 | 2 | 3 |
| 9.509999999999671 | 1 | 2 | 3 |
| 9.519999999999673 | 1 | 2 | 3 |
| 9.529999999999673 | 1 | 2 | 3 |
| 9.539999999999672 | 1 | 2 | 3 |
| 9.549999999999672 | 1 | 2 | 3 |
| 9.55999999999967 | 1 | 2 | 3 |
| 9.56999999999967 | 1 | 2 | 3 |
| 9.57999999999967 | 1 | 2 | 3 |
| 9.58999999999967 | 1 | 2 | 3 |
| 9.59999999999967 | 1 | 2 | 3 |
| 9.60999999999967 | 1 | 2 | 3 |
| 9.61999999999967 | 1 | 2 | 3 |
| 9.62999999999967 | 1 | 2 | 3 |
| 9.63999999999967 | 1 | 2 | 3 |
| 9.64999999999967 | 1 | 2 | 3 |
| 9.65999999999967 | 1 | 2 | 3 |
| 9.66999999999967 | 1 | 2 | 3 |
| 9.67999999999967 | 1 | 2 | 3 |
| 9.689999999999667 | 1 | 2 | 3 |
| 9.699999999999669 | 1 | 2 | 3 |
| 9.709999999999669 | 1 | 2 | 3 |
| 9.719999999999668 | 1 | 2 | 3 |
| 9.729999999999668 | 1 | 2 | 3 |
| 9.739999999999666 | 1 | 2 | 3 |
| 9.749999999999668 | 1 | 2 | 3 |
| 9.759999999999668 | 1 | 2 | 3 |
| 9.769999999999667 | 1 | 2 | 3 |
| 9.779999999999667 | 1 | 2 | 3 |
| 9.789999999999665 | 1 | 2 | 3 |
| 9.799999999999667 | 1 | 2 | 3 |
| 9.809999999999667 | 1 | 2 | 3 |
| 9.819999999999666 | 1 | 2 | 3 |
| 9.829999999999666 | 1 | 2 | 3 |
| 9.839999999999664 | 1 | 2 | 3 |
| 9.849999999999666 | 1 | 2 | 3 |
| 9.859999999999665 | 1 | 2 | 3 |
| 9.869999999999665 | 1 | 2 | 3 |
| 9.879999999999663 | 1 | 2 | 3 |
| 9.889999999999665 | 1 | 2 | 3 |
| 9.899999999999665 | 1 | 2 | 3 |
| 9.909999999999664 | 1 | 2 | 3 |
| 9.919999999999664 | 1 | 2 | 3 |
| 9.929999999999662 | 1 | 2 | 3 |
| 9.939999999999664 | 1 | 2 | 3 |
| 9.949999999999664 | 1 | 2 | 3 |
| 9.95999999999966 | 1 | 2 | 3 |
| 9.96999999999966 | 1 | 2 | 3 |
| 9.97999999999966 | 1 | 2 | 3 |
| 9.98999999999966 | 1 | 2 | 3 |
| 9.99999999999966 | 1 | 2 | 3 |